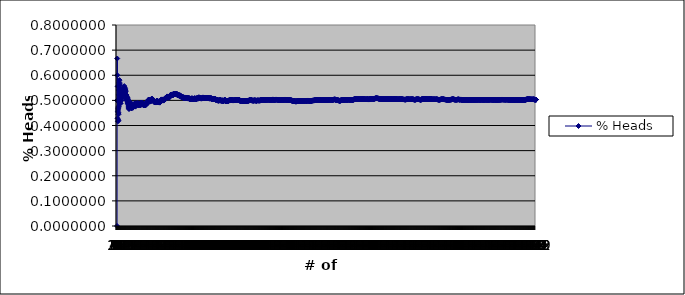
| Category | % Heads |
|---|---|
| 0 | 0 |
| 1 | 0.5 |
| 2 | 0.667 |
| 3 | 0.5 |
| 4 | 0.6 |
| 5 | 0.5 |
| 6 | 0.429 |
| 7 | 0.5 |
| 8 | 0.556 |
| 9 | 0.5 |
| 10 | 0.455 |
| 11 | 0.417 |
| 12 | 0.462 |
| 13 | 0.5 |
| 14 | 0.467 |
| 15 | 0.5 |
| 16 | 0.471 |
| 17 | 0.444 |
| 18 | 0.421 |
| 19 | 0.45 |
| 20 | 0.476 |
| 21 | 0.5 |
| 22 | 0.522 |
| 23 | 0.542 |
| 24 | 0.56 |
| 25 | 0.538 |
| 26 | 0.556 |
| 27 | 0.571 |
| 28 | 0.552 |
| 29 | 0.567 |
| 30 | 0.581 |
| 31 | 0.562 |
| 32 | 0.545 |
| 33 | 0.529 |
| 34 | 0.543 |
| 35 | 0.528 |
| 36 | 0.514 |
| 37 | 0.5 |
| 38 | 0.487 |
| 39 | 0.5 |
| 40 | 0.512 |
| 41 | 0.5 |
| 42 | 0.488 |
| 43 | 0.5 |
| 44 | 0.511 |
| 45 | 0.5 |
| 46 | 0.511 |
| 47 | 0.521 |
| 48 | 0.51 |
| 49 | 0.5 |
| 50 | 0.51 |
| 51 | 0.519 |
| 52 | 0.509 |
| 53 | 0.5 |
| 54 | 0.509 |
| 55 | 0.518 |
| 56 | 0.526 |
| 57 | 0.517 |
| 58 | 0.525 |
| 59 | 0.533 |
| 60 | 0.541 |
| 61 | 0.532 |
| 62 | 0.524 |
| 63 | 0.531 |
| 64 | 0.523 |
| 65 | 0.53 |
| 66 | 0.537 |
| 67 | 0.544 |
| 68 | 0.536 |
| 69 | 0.529 |
| 70 | 0.521 |
| 71 | 0.528 |
| 72 | 0.534 |
| 73 | 0.541 |
| 74 | 0.547 |
| 75 | 0.539 |
| 76 | 0.532 |
| 77 | 0.538 |
| 78 | 0.544 |
| 79 | 0.538 |
| 80 | 0.543 |
| 81 | 0.537 |
| 82 | 0.53 |
| 83 | 0.536 |
| 84 | 0.541 |
| 85 | 0.547 |
| 86 | 0.552 |
| 87 | 0.557 |
| 88 | 0.551 |
| 89 | 0.544 |
| 90 | 0.549 |
| 91 | 0.543 |
| 92 | 0.538 |
| 93 | 0.532 |
| 94 | 0.537 |
| 95 | 0.542 |
| 96 | 0.546 |
| 97 | 0.541 |
| 98 | 0.535 |
| 99 | 0.54 |
| 100 | 0.535 |
| 101 | 0.529 |
| 102 | 0.524 |
| 103 | 0.519 |
| 104 | 0.524 |
| 105 | 0.519 |
| 106 | 0.523 |
| 107 | 0.519 |
| 108 | 0.523 |
| 109 | 0.518 |
| 110 | 0.514 |
| 111 | 0.509 |
| 112 | 0.504 |
| 113 | 0.5 |
| 114 | 0.504 |
| 115 | 0.509 |
| 116 | 0.513 |
| 117 | 0.508 |
| 118 | 0.513 |
| 119 | 0.508 |
| 120 | 0.512 |
| 121 | 0.508 |
| 122 | 0.512 |
| 123 | 0.508 |
| 124 | 0.504 |
| 125 | 0.5 |
| 126 | 0.504 |
| 127 | 0.5 |
| 128 | 0.496 |
| 129 | 0.492 |
| 130 | 0.489 |
| 131 | 0.492 |
| 132 | 0.489 |
| 133 | 0.485 |
| 134 | 0.489 |
| 135 | 0.485 |
| 136 | 0.489 |
| 137 | 0.486 |
| 138 | 0.482 |
| 139 | 0.479 |
| 140 | 0.475 |
| 141 | 0.472 |
| 142 | 0.469 |
| 143 | 0.465 |
| 144 | 0.469 |
| 145 | 0.473 |
| 146 | 0.476 |
| 147 | 0.48 |
| 148 | 0.477 |
| 149 | 0.48 |
| 150 | 0.483 |
| 151 | 0.487 |
| 152 | 0.49 |
| 153 | 0.487 |
| 154 | 0.49 |
| 155 | 0.494 |
| 156 | 0.49 |
| 157 | 0.487 |
| 158 | 0.484 |
| 159 | 0.488 |
| 160 | 0.484 |
| 161 | 0.481 |
| 162 | 0.479 |
| 163 | 0.482 |
| 164 | 0.485 |
| 165 | 0.488 |
| 166 | 0.485 |
| 167 | 0.482 |
| 168 | 0.479 |
| 169 | 0.476 |
| 170 | 0.474 |
| 171 | 0.471 |
| 172 | 0.468 |
| 173 | 0.471 |
| 174 | 0.474 |
| 175 | 0.472 |
| 176 | 0.469 |
| 177 | 0.472 |
| 178 | 0.475 |
| 179 | 0.478 |
| 180 | 0.481 |
| 181 | 0.478 |
| 182 | 0.475 |
| 183 | 0.473 |
| 184 | 0.476 |
| 185 | 0.473 |
| 186 | 0.476 |
| 187 | 0.473 |
| 188 | 0.471 |
| 189 | 0.474 |
| 190 | 0.471 |
| 191 | 0.474 |
| 192 | 0.477 |
| 193 | 0.479 |
| 194 | 0.477 |
| 195 | 0.48 |
| 196 | 0.477 |
| 197 | 0.48 |
| 198 | 0.477 |
| 199 | 0.48 |
| 200 | 0.478 |
| 201 | 0.48 |
| 202 | 0.483 |
| 203 | 0.48 |
| 204 | 0.483 |
| 205 | 0.481 |
| 206 | 0.478 |
| 207 | 0.481 |
| 208 | 0.483 |
| 209 | 0.481 |
| 210 | 0.483 |
| 211 | 0.486 |
| 212 | 0.488 |
| 213 | 0.486 |
| 214 | 0.488 |
| 215 | 0.486 |
| 216 | 0.484 |
| 217 | 0.482 |
| 218 | 0.479 |
| 219 | 0.477 |
| 220 | 0.475 |
| 221 | 0.477 |
| 222 | 0.48 |
| 223 | 0.482 |
| 224 | 0.484 |
| 225 | 0.482 |
| 226 | 0.485 |
| 227 | 0.482 |
| 228 | 0.48 |
| 229 | 0.483 |
| 230 | 0.481 |
| 231 | 0.483 |
| 232 | 0.485 |
| 233 | 0.487 |
| 234 | 0.485 |
| 235 | 0.483 |
| 236 | 0.481 |
| 237 | 0.483 |
| 238 | 0.485 |
| 239 | 0.488 |
| 240 | 0.49 |
| 241 | 0.488 |
| 242 | 0.486 |
| 243 | 0.488 |
| 244 | 0.486 |
| 245 | 0.488 |
| 246 | 0.486 |
| 247 | 0.484 |
| 248 | 0.482 |
| 249 | 0.484 |
| 250 | 0.486 |
| 251 | 0.488 |
| 252 | 0.486 |
| 253 | 0.488 |
| 254 | 0.486 |
| 255 | 0.484 |
| 256 | 0.482 |
| 257 | 0.481 |
| 258 | 0.483 |
| 259 | 0.481 |
| 260 | 0.483 |
| 261 | 0.485 |
| 262 | 0.487 |
| 263 | 0.485 |
| 264 | 0.483 |
| 265 | 0.485 |
| 266 | 0.483 |
| 267 | 0.481 |
| 268 | 0.483 |
| 269 | 0.485 |
| 270 | 0.483 |
| 271 | 0.485 |
| 272 | 0.484 |
| 273 | 0.485 |
| 274 | 0.484 |
| 275 | 0.486 |
| 276 | 0.484 |
| 277 | 0.482 |
| 278 | 0.48 |
| 279 | 0.482 |
| 280 | 0.484 |
| 281 | 0.486 |
| 282 | 0.488 |
| 283 | 0.489 |
| 284 | 0.491 |
| 285 | 0.49 |
| 286 | 0.488 |
| 287 | 0.49 |
| 288 | 0.488 |
| 289 | 0.486 |
| 290 | 0.485 |
| 291 | 0.483 |
| 292 | 0.485 |
| 293 | 0.483 |
| 294 | 0.485 |
| 295 | 0.486 |
| 296 | 0.485 |
| 297 | 0.483 |
| 298 | 0.485 |
| 299 | 0.487 |
| 300 | 0.488 |
| 301 | 0.49 |
| 302 | 0.488 |
| 303 | 0.487 |
| 304 | 0.489 |
| 305 | 0.487 |
| 306 | 0.489 |
| 307 | 0.487 |
| 308 | 0.485 |
| 309 | 0.487 |
| 310 | 0.486 |
| 311 | 0.487 |
| 312 | 0.486 |
| 313 | 0.484 |
| 314 | 0.483 |
| 315 | 0.484 |
| 316 | 0.483 |
| 317 | 0.481 |
| 318 | 0.483 |
| 319 | 0.481 |
| 320 | 0.48 |
| 321 | 0.481 |
| 322 | 0.483 |
| 323 | 0.481 |
| 324 | 0.483 |
| 325 | 0.482 |
| 326 | 0.48 |
| 327 | 0.482 |
| 328 | 0.483 |
| 329 | 0.482 |
| 330 | 0.48 |
| 331 | 0.482 |
| 332 | 0.483 |
| 333 | 0.482 |
| 334 | 0.481 |
| 335 | 0.482 |
| 336 | 0.481 |
| 337 | 0.482 |
| 338 | 0.481 |
| 339 | 0.482 |
| 340 | 0.484 |
| 341 | 0.482 |
| 342 | 0.484 |
| 343 | 0.485 |
| 344 | 0.484 |
| 345 | 0.483 |
| 346 | 0.484 |
| 347 | 0.483 |
| 348 | 0.484 |
| 349 | 0.486 |
| 350 | 0.484 |
| 351 | 0.486 |
| 352 | 0.487 |
| 353 | 0.489 |
| 354 | 0.49 |
| 355 | 0.492 |
| 356 | 0.49 |
| 357 | 0.492 |
| 358 | 0.493 |
| 359 | 0.494 |
| 360 | 0.493 |
| 361 | 0.494 |
| 362 | 0.493 |
| 363 | 0.492 |
| 364 | 0.493 |
| 365 | 0.495 |
| 366 | 0.493 |
| 367 | 0.495 |
| 368 | 0.496 |
| 369 | 0.497 |
| 370 | 0.499 |
| 371 | 0.5 |
| 372 | 0.501 |
| 373 | 0.5 |
| 374 | 0.501 |
| 375 | 0.5 |
| 376 | 0.499 |
| 377 | 0.5 |
| 378 | 0.499 |
| 379 | 0.5 |
| 380 | 0.501 |
| 381 | 0.503 |
| 382 | 0.501 |
| 383 | 0.5 |
| 384 | 0.501 |
| 385 | 0.5 |
| 386 | 0.501 |
| 387 | 0.5 |
| 388 | 0.501 |
| 389 | 0.5 |
| 390 | 0.499 |
| 391 | 0.497 |
| 392 | 0.496 |
| 393 | 0.495 |
| 394 | 0.496 |
| 395 | 0.497 |
| 396 | 0.496 |
| 397 | 0.497 |
| 398 | 0.499 |
| 399 | 0.498 |
| 400 | 0.496 |
| 401 | 0.498 |
| 402 | 0.496 |
| 403 | 0.498 |
| 404 | 0.499 |
| 405 | 0.5 |
| 406 | 0.499 |
| 407 | 0.5 |
| 408 | 0.501 |
| 409 | 0.5 |
| 410 | 0.501 |
| 411 | 0.502 |
| 412 | 0.504 |
| 413 | 0.505 |
| 414 | 0.506 |
| 415 | 0.507 |
| 416 | 0.506 |
| 417 | 0.505 |
| 418 | 0.504 |
| 419 | 0.505 |
| 420 | 0.504 |
| 421 | 0.505 |
| 422 | 0.504 |
| 423 | 0.502 |
| 424 | 0.501 |
| 425 | 0.502 |
| 426 | 0.501 |
| 427 | 0.502 |
| 428 | 0.501 |
| 429 | 0.5 |
| 430 | 0.501 |
| 431 | 0.502 |
| 432 | 0.501 |
| 433 | 0.5 |
| 434 | 0.499 |
| 435 | 0.5 |
| 436 | 0.499 |
| 437 | 0.498 |
| 438 | 0.497 |
| 439 | 0.495 |
| 440 | 0.497 |
| 441 | 0.495 |
| 442 | 0.497 |
| 443 | 0.495 |
| 444 | 0.494 |
| 445 | 0.493 |
| 446 | 0.492 |
| 447 | 0.493 |
| 448 | 0.494 |
| 449 | 0.493 |
| 450 | 0.494 |
| 451 | 0.496 |
| 452 | 0.494 |
| 453 | 0.493 |
| 454 | 0.495 |
| 455 | 0.496 |
| 456 | 0.495 |
| 457 | 0.493 |
| 458 | 0.492 |
| 459 | 0.493 |
| 460 | 0.495 |
| 461 | 0.494 |
| 462 | 0.492 |
| 463 | 0.491 |
| 464 | 0.492 |
| 465 | 0.494 |
| 466 | 0.495 |
| 467 | 0.494 |
| 468 | 0.495 |
| 469 | 0.496 |
| 470 | 0.495 |
| 471 | 0.494 |
| 472 | 0.495 |
| 473 | 0.496 |
| 474 | 0.497 |
| 475 | 0.498 |
| 476 | 0.499 |
| 477 | 0.498 |
| 478 | 0.497 |
| 479 | 0.496 |
| 480 | 0.497 |
| 481 | 0.498 |
| 482 | 0.497 |
| 483 | 0.498 |
| 484 | 0.497 |
| 485 | 0.496 |
| 486 | 0.495 |
| 487 | 0.494 |
| 488 | 0.493 |
| 489 | 0.492 |
| 490 | 0.493 |
| 491 | 0.494 |
| 492 | 0.495 |
| 493 | 0.496 |
| 494 | 0.495 |
| 495 | 0.494 |
| 496 | 0.493 |
| 497 | 0.492 |
| 498 | 0.493 |
| 499 | 0.492 |
| 500 | 0.493 |
| 501 | 0.492 |
| 502 | 0.493 |
| 503 | 0.494 |
| 504 | 0.495 |
| 505 | 0.494 |
| 506 | 0.493 |
| 507 | 0.492 |
| 508 | 0.491 |
| 509 | 0.492 |
| 510 | 0.491 |
| 511 | 0.492 |
| 512 | 0.493 |
| 513 | 0.494 |
| 514 | 0.495 |
| 515 | 0.494 |
| 516 | 0.495 |
| 517 | 0.496 |
| 518 | 0.497 |
| 519 | 0.498 |
| 520 | 0.497 |
| 521 | 0.498 |
| 522 | 0.497 |
| 523 | 0.498 |
| 524 | 0.499 |
| 525 | 0.5 |
| 526 | 0.501 |
| 527 | 0.502 |
| 528 | 0.501 |
| 529 | 0.502 |
| 530 | 0.503 |
| 531 | 0.504 |
| 532 | 0.503 |
| 533 | 0.502 |
| 534 | 0.501 |
| 535 | 0.502 |
| 536 | 0.503 |
| 537 | 0.504 |
| 538 | 0.503 |
| 539 | 0.502 |
| 540 | 0.501 |
| 541 | 0.502 |
| 542 | 0.501 |
| 543 | 0.5 |
| 544 | 0.499 |
| 545 | 0.5 |
| 546 | 0.501 |
| 547 | 0.502 |
| 548 | 0.503 |
| 549 | 0.504 |
| 550 | 0.503 |
| 551 | 0.502 |
| 552 | 0.501 |
| 553 | 0.5 |
| 554 | 0.499 |
| 555 | 0.5 |
| 556 | 0.501 |
| 557 | 0.502 |
| 558 | 0.501 |
| 559 | 0.502 |
| 560 | 0.503 |
| 561 | 0.504 |
| 562 | 0.504 |
| 563 | 0.504 |
| 564 | 0.503 |
| 565 | 0.504 |
| 566 | 0.504 |
| 567 | 0.505 |
| 568 | 0.504 |
| 569 | 0.504 |
| 570 | 0.504 |
| 571 | 0.505 |
| 572 | 0.506 |
| 573 | 0.505 |
| 574 | 0.506 |
| 575 | 0.507 |
| 576 | 0.508 |
| 577 | 0.509 |
| 578 | 0.509 |
| 579 | 0.509 |
| 580 | 0.508 |
| 581 | 0.509 |
| 582 | 0.508 |
| 583 | 0.507 |
| 584 | 0.508 |
| 585 | 0.509 |
| 586 | 0.509 |
| 587 | 0.51 |
| 588 | 0.509 |
| 589 | 0.51 |
| 590 | 0.511 |
| 591 | 0.51 |
| 592 | 0.511 |
| 593 | 0.512 |
| 594 | 0.513 |
| 595 | 0.513 |
| 596 | 0.513 |
| 597 | 0.513 |
| 598 | 0.514 |
| 599 | 0.515 |
| 600 | 0.516 |
| 601 | 0.515 |
| 602 | 0.514 |
| 603 | 0.513 |
| 604 | 0.512 |
| 605 | 0.513 |
| 606 | 0.512 |
| 607 | 0.513 |
| 608 | 0.514 |
| 609 | 0.515 |
| 610 | 0.514 |
| 611 | 0.513 |
| 612 | 0.512 |
| 613 | 0.511 |
| 614 | 0.512 |
| 615 | 0.513 |
| 616 | 0.512 |
| 617 | 0.511 |
| 618 | 0.511 |
| 619 | 0.511 |
| 620 | 0.51 |
| 621 | 0.511 |
| 622 | 0.512 |
| 623 | 0.513 |
| 624 | 0.512 |
| 625 | 0.513 |
| 626 | 0.514 |
| 627 | 0.514 |
| 628 | 0.515 |
| 629 | 0.516 |
| 630 | 0.517 |
| 631 | 0.517 |
| 632 | 0.518 |
| 633 | 0.519 |
| 634 | 0.518 |
| 635 | 0.519 |
| 636 | 0.52 |
| 637 | 0.52 |
| 638 | 0.521 |
| 639 | 0.522 |
| 640 | 0.521 |
| 641 | 0.522 |
| 642 | 0.521 |
| 643 | 0.52 |
| 644 | 0.521 |
| 645 | 0.522 |
| 646 | 0.521 |
| 647 | 0.522 |
| 648 | 0.522 |
| 649 | 0.523 |
| 650 | 0.522 |
| 651 | 0.521 |
| 652 | 0.522 |
| 653 | 0.523 |
| 654 | 0.522 |
| 655 | 0.521 |
| 656 | 0.521 |
| 657 | 0.521 |
| 658 | 0.522 |
| 659 | 0.523 |
| 660 | 0.523 |
| 661 | 0.524 |
| 662 | 0.523 |
| 663 | 0.523 |
| 664 | 0.522 |
| 665 | 0.523 |
| 666 | 0.522 |
| 667 | 0.521 |
| 668 | 0.522 |
| 669 | 0.522 |
| 670 | 0.523 |
| 671 | 0.522 |
| 672 | 0.523 |
| 673 | 0.524 |
| 674 | 0.524 |
| 675 | 0.525 |
| 676 | 0.524 |
| 677 | 0.525 |
| 678 | 0.524 |
| 679 | 0.524 |
| 680 | 0.524 |
| 681 | 0.525 |
| 682 | 0.524 |
| 683 | 0.523 |
| 684 | 0.524 |
| 685 | 0.525 |
| 686 | 0.524 |
| 687 | 0.525 |
| 688 | 0.524 |
| 689 | 0.525 |
| 690 | 0.524 |
| 691 | 0.525 |
| 692 | 0.525 |
| 693 | 0.524 |
| 694 | 0.525 |
| 695 | 0.524 |
| 696 | 0.524 |
| 697 | 0.524 |
| 698 | 0.525 |
| 699 | 0.526 |
| 700 | 0.525 |
| 701 | 0.524 |
| 702 | 0.523 |
| 703 | 0.524 |
| 704 | 0.525 |
| 705 | 0.524 |
| 706 | 0.525 |
| 707 | 0.525 |
| 708 | 0.525 |
| 709 | 0.525 |
| 710 | 0.525 |
| 711 | 0.524 |
| 712 | 0.525 |
| 713 | 0.524 |
| 714 | 0.524 |
| 715 | 0.525 |
| 716 | 0.524 |
| 717 | 0.524 |
| 718 | 0.523 |
| 719 | 0.522 |
| 720 | 0.521 |
| 721 | 0.521 |
| 722 | 0.521 |
| 723 | 0.521 |
| 724 | 0.521 |
| 725 | 0.522 |
| 726 | 0.521 |
| 727 | 0.521 |
| 728 | 0.521 |
| 729 | 0.521 |
| 730 | 0.521 |
| 731 | 0.52 |
| 732 | 0.521 |
| 733 | 0.52 |
| 734 | 0.521 |
| 735 | 0.522 |
| 736 | 0.521 |
| 737 | 0.522 |
| 738 | 0.521 |
| 739 | 0.52 |
| 740 | 0.52 |
| 741 | 0.52 |
| 742 | 0.52 |
| 743 | 0.519 |
| 744 | 0.518 |
| 745 | 0.519 |
| 746 | 0.518 |
| 747 | 0.517 |
| 748 | 0.518 |
| 749 | 0.519 |
| 750 | 0.519 |
| 751 | 0.52 |
| 752 | 0.519 |
| 753 | 0.52 |
| 754 | 0.519 |
| 755 | 0.519 |
| 756 | 0.518 |
| 757 | 0.517 |
| 758 | 0.518 |
| 759 | 0.517 |
| 760 | 0.516 |
| 761 | 0.517 |
| 762 | 0.516 |
| 763 | 0.516 |
| 764 | 0.515 |
| 765 | 0.514 |
| 766 | 0.515 |
| 767 | 0.514 |
| 768 | 0.515 |
| 769 | 0.514 |
| 770 | 0.514 |
| 771 | 0.514 |
| 772 | 0.515 |
| 773 | 0.514 |
| 774 | 0.514 |
| 775 | 0.513 |
| 776 | 0.514 |
| 777 | 0.514 |
| 778 | 0.515 |
| 779 | 0.514 |
| 780 | 0.513 |
| 781 | 0.513 |
| 782 | 0.512 |
| 783 | 0.511 |
| 784 | 0.511 |
| 785 | 0.511 |
| 786 | 0.512 |
| 787 | 0.513 |
| 788 | 0.512 |
| 789 | 0.513 |
| 790 | 0.512 |
| 791 | 0.511 |
| 792 | 0.511 |
| 793 | 0.51 |
| 794 | 0.509 |
| 795 | 0.51 |
| 796 | 0.509 |
| 797 | 0.51 |
| 798 | 0.509 |
| 799 | 0.51 |
| 800 | 0.511 |
| 801 | 0.51 |
| 802 | 0.511 |
| 803 | 0.51 |
| 804 | 0.511 |
| 805 | 0.511 |
| 806 | 0.512 |
| 807 | 0.511 |
| 808 | 0.511 |
| 809 | 0.511 |
| 810 | 0.51 |
| 811 | 0.51 |
| 812 | 0.509 |
| 813 | 0.51 |
| 814 | 0.509 |
| 815 | 0.51 |
| 816 | 0.509 |
| 817 | 0.51 |
| 818 | 0.509 |
| 819 | 0.51 |
| 820 | 0.509 |
| 821 | 0.51 |
| 822 | 0.509 |
| 823 | 0.51 |
| 824 | 0.51 |
| 825 | 0.511 |
| 826 | 0.51 |
| 827 | 0.51 |
| 828 | 0.509 |
| 829 | 0.508 |
| 830 | 0.508 |
| 831 | 0.508 |
| 832 | 0.508 |
| 833 | 0.508 |
| 834 | 0.509 |
| 835 | 0.508 |
| 836 | 0.508 |
| 837 | 0.508 |
| 838 | 0.508 |
| 839 | 0.508 |
| 840 | 0.508 |
| 841 | 0.508 |
| 842 | 0.509 |
| 843 | 0.508 |
| 844 | 0.509 |
| 845 | 0.508 |
| 846 | 0.508 |
| 847 | 0.507 |
| 848 | 0.508 |
| 849 | 0.508 |
| 850 | 0.508 |
| 851 | 0.508 |
| 852 | 0.509 |
| 853 | 0.508 |
| 854 | 0.508 |
| 855 | 0.508 |
| 856 | 0.508 |
| 857 | 0.507 |
| 858 | 0.508 |
| 859 | 0.508 |
| 860 | 0.509 |
| 861 | 0.508 |
| 862 | 0.508 |
| 863 | 0.507 |
| 864 | 0.508 |
| 865 | 0.508 |
| 866 | 0.507 |
| 867 | 0.507 |
| 868 | 0.506 |
| 869 | 0.506 |
| 870 | 0.506 |
| 871 | 0.506 |
| 872 | 0.505 |
| 873 | 0.506 |
| 874 | 0.505 |
| 875 | 0.506 |
| 876 | 0.506 |
| 877 | 0.506 |
| 878 | 0.506 |
| 879 | 0.507 |
| 880 | 0.506 |
| 881 | 0.507 |
| 882 | 0.506 |
| 883 | 0.507 |
| 884 | 0.506 |
| 885 | 0.506 |
| 886 | 0.506 |
| 887 | 0.506 |
| 888 | 0.506 |
| 889 | 0.507 |
| 890 | 0.507 |
| 891 | 0.508 |
| 892 | 0.507 |
| 893 | 0.508 |
| 894 | 0.508 |
| 895 | 0.508 |
| 896 | 0.507 |
| 897 | 0.508 |
| 898 | 0.507 |
| 899 | 0.507 |
| 900 | 0.507 |
| 901 | 0.507 |
| 902 | 0.506 |
| 903 | 0.506 |
| 904 | 0.506 |
| 905 | 0.507 |
| 906 | 0.506 |
| 907 | 0.506 |
| 908 | 0.505 |
| 909 | 0.504 |
| 910 | 0.504 |
| 911 | 0.504 |
| 912 | 0.504 |
| 913 | 0.504 |
| 914 | 0.505 |
| 915 | 0.505 |
| 916 | 0.506 |
| 917 | 0.505 |
| 918 | 0.506 |
| 919 | 0.507 |
| 920 | 0.507 |
| 921 | 0.507 |
| 922 | 0.506 |
| 923 | 0.506 |
| 924 | 0.507 |
| 925 | 0.508 |
| 926 | 0.508 |
| 927 | 0.509 |
| 928 | 0.508 |
| 929 | 0.508 |
| 930 | 0.507 |
| 931 | 0.508 |
| 932 | 0.507 |
| 933 | 0.506 |
| 934 | 0.507 |
| 935 | 0.506 |
| 936 | 0.507 |
| 937 | 0.506 |
| 938 | 0.506 |
| 939 | 0.505 |
| 940 | 0.506 |
| 941 | 0.505 |
| 942 | 0.506 |
| 943 | 0.505 |
| 944 | 0.505 |
| 945 | 0.505 |
| 946 | 0.506 |
| 947 | 0.506 |
| 948 | 0.507 |
| 949 | 0.507 |
| 950 | 0.508 |
| 951 | 0.507 |
| 952 | 0.508 |
| 953 | 0.508 |
| 954 | 0.509 |
| 955 | 0.508 |
| 956 | 0.508 |
| 957 | 0.508 |
| 958 | 0.508 |
| 959 | 0.507 |
| 960 | 0.508 |
| 961 | 0.507 |
| 962 | 0.507 |
| 963 | 0.507 |
| 964 | 0.507 |
| 965 | 0.507 |
| 966 | 0.508 |
| 967 | 0.508 |
| 968 | 0.509 |
| 969 | 0.508 |
| 970 | 0.509 |
| 971 | 0.509 |
| 972 | 0.51 |
| 973 | 0.51 |
| 974 | 0.511 |
| 975 | 0.511 |
| 976 | 0.512 |
| 977 | 0.512 |
| 978 | 0.512 |
| 979 | 0.511 |
| 980 | 0.511 |
| 981 | 0.51 |
| 982 | 0.511 |
| 983 | 0.51 |
| 984 | 0.51 |
| 985 | 0.509 |
| 986 | 0.51 |
| 987 | 0.51 |
| 988 | 0.51 |
| 989 | 0.509 |
| 990 | 0.509 |
| 991 | 0.509 |
| 992 | 0.509 |
| 993 | 0.509 |
| 994 | 0.51 |
| 995 | 0.51 |
| 996 | 0.51 |
| 997 | 0.51 |
| 998 | 0.51 |
| 999 | 0.509 |
| 1000 | 0.508 |
| 1001 | 0.509 |
| 1002 | 0.508 |
| 1003 | 0.508 |
| 1004 | 0.507 |
| 1005 | 0.507 |
| 1006 | 0.507 |
| 1007 | 0.507 |
| 1008 | 0.507 |
| 1009 | 0.508 |
| 1010 | 0.507 |
| 1011 | 0.508 |
| 1012 | 0.507 |
| 1013 | 0.508 |
| 1014 | 0.508 |
| 1015 | 0.509 |
| 1016 | 0.509 |
| 1017 | 0.509 |
| 1018 | 0.509 |
| 1019 | 0.51 |
| 1020 | 0.51 |
| 1021 | 0.51 |
| 1022 | 0.51 |
| 1023 | 0.511 |
| 1024 | 0.511 |
| 1025 | 0.512 |
| 1026 | 0.511 |
| 1027 | 0.512 |
| 1028 | 0.511 |
| 1029 | 0.511 |
| 1030 | 0.511 |
| 1031 | 0.511 |
| 1032 | 0.511 |
| 1033 | 0.511 |
| 1034 | 0.51 |
| 1035 | 0.511 |
| 1036 | 0.511 |
| 1037 | 0.511 |
| 1038 | 0.51 |
| 1039 | 0.51 |
| 1040 | 0.509 |
| 1041 | 0.509 |
| 1042 | 0.509 |
| 1043 | 0.51 |
| 1044 | 0.51 |
| 1045 | 0.511 |
| 1046 | 0.51 |
| 1047 | 0.51 |
| 1048 | 0.51 |
| 1049 | 0.51 |
| 1050 | 0.51 |
| 1051 | 0.51 |
| 1052 | 0.51 |
| 1053 | 0.509 |
| 1054 | 0.51 |
| 1055 | 0.509 |
| 1056 | 0.51 |
| 1057 | 0.51 |
| 1058 | 0.511 |
| 1059 | 0.51 |
| 1060 | 0.511 |
| 1061 | 0.51 |
| 1062 | 0.51 |
| 1063 | 0.51 |
| 1064 | 0.51 |
| 1065 | 0.509 |
| 1066 | 0.509 |
| 1067 | 0.509 |
| 1068 | 0.51 |
| 1069 | 0.51 |
| 1070 | 0.51 |
| 1071 | 0.51 |
| 1072 | 0.51 |
| 1073 | 0.509 |
| 1074 | 0.51 |
| 1075 | 0.509 |
| 1076 | 0.51 |
| 1077 | 0.509 |
| 1078 | 0.51 |
| 1079 | 0.51 |
| 1080 | 0.51 |
| 1081 | 0.509 |
| 1082 | 0.51 |
| 1083 | 0.51 |
| 1084 | 0.51 |
| 1085 | 0.509 |
| 1086 | 0.51 |
| 1087 | 0.51 |
| 1088 | 0.511 |
| 1089 | 0.51 |
| 1090 | 0.51 |
| 1091 | 0.51 |
| 1092 | 0.511 |
| 1093 | 0.51 |
| 1094 | 0.511 |
| 1095 | 0.51 |
| 1096 | 0.51 |
| 1097 | 0.509 |
| 1098 | 0.509 |
| 1099 | 0.509 |
| 1100 | 0.509 |
| 1101 | 0.508 |
| 1102 | 0.508 |
| 1103 | 0.507 |
| 1104 | 0.508 |
| 1105 | 0.507 |
| 1106 | 0.507 |
| 1107 | 0.507 |
| 1108 | 0.508 |
| 1109 | 0.507 |
| 1110 | 0.508 |
| 1111 | 0.508 |
| 1112 | 0.509 |
| 1113 | 0.508 |
| 1114 | 0.508 |
| 1115 | 0.508 |
| 1116 | 0.509 |
| 1117 | 0.508 |
| 1118 | 0.508 |
| 1119 | 0.508 |
| 1120 | 0.508 |
| 1121 | 0.509 |
| 1122 | 0.508 |
| 1123 | 0.508 |
| 1124 | 0.508 |
| 1125 | 0.507 |
| 1126 | 0.507 |
| 1127 | 0.507 |
| 1128 | 0.508 |
| 1129 | 0.507 |
| 1130 | 0.507 |
| 1131 | 0.506 |
| 1132 | 0.506 |
| 1133 | 0.505 |
| 1134 | 0.505 |
| 1135 | 0.505 |
| 1136 | 0.506 |
| 1137 | 0.506 |
| 1138 | 0.506 |
| 1139 | 0.505 |
| 1140 | 0.505 |
| 1141 | 0.505 |
| 1142 | 0.506 |
| 1143 | 0.506 |
| 1144 | 0.506 |
| 1145 | 0.506 |
| 1146 | 0.506 |
| 1147 | 0.505 |
| 1148 | 0.506 |
| 1149 | 0.506 |
| 1150 | 0.506 |
| 1151 | 0.505 |
| 1152 | 0.505 |
| 1153 | 0.504 |
| 1154 | 0.505 |
| 1155 | 0.505 |
| 1156 | 0.506 |
| 1157 | 0.506 |
| 1158 | 0.506 |
| 1159 | 0.505 |
| 1160 | 0.505 |
| 1161 | 0.505 |
| 1162 | 0.505 |
| 1163 | 0.505 |
| 1164 | 0.505 |
| 1165 | 0.505 |
| 1166 | 0.505 |
| 1167 | 0.505 |
| 1168 | 0.506 |
| 1169 | 0.505 |
| 1170 | 0.505 |
| 1171 | 0.505 |
| 1172 | 0.505 |
| 1173 | 0.505 |
| 1174 | 0.505 |
| 1175 | 0.504 |
| 1176 | 0.504 |
| 1177 | 0.503 |
| 1178 | 0.503 |
| 1179 | 0.503 |
| 1180 | 0.502 |
| 1181 | 0.503 |
| 1182 | 0.502 |
| 1183 | 0.503 |
| 1184 | 0.503 |
| 1185 | 0.503 |
| 1186 | 0.502 |
| 1187 | 0.503 |
| 1188 | 0.503 |
| 1189 | 0.503 |
| 1190 | 0.503 |
| 1191 | 0.503 |
| 1192 | 0.503 |
| 1193 | 0.503 |
| 1194 | 0.502 |
| 1195 | 0.502 |
| 1196 | 0.501 |
| 1197 | 0.502 |
| 1198 | 0.501 |
| 1199 | 0.502 |
| 1200 | 0.501 |
| 1201 | 0.501 |
| 1202 | 0.501 |
| 1203 | 0.501 |
| 1204 | 0.5 |
| 1205 | 0.5 |
| 1206 | 0.5 |
| 1207 | 0.499 |
| 1208 | 0.499 |
| 1209 | 0.498 |
| 1210 | 0.499 |
| 1211 | 0.499 |
| 1212 | 0.5 |
| 1213 | 0.499 |
| 1214 | 0.5 |
| 1215 | 0.5 |
| 1216 | 0.5 |
| 1217 | 0.5 |
| 1218 | 0.5 |
| 1219 | 0.499 |
| 1220 | 0.5 |
| 1221 | 0.499 |
| 1222 | 0.5 |
| 1223 | 0.5 |
| 1224 | 0.5 |
| 1225 | 0.5 |
| 1226 | 0.5 |
| 1227 | 0.501 |
| 1228 | 0.5 |
| 1229 | 0.501 |
| 1230 | 0.501 |
| 1231 | 0.501 |
| 1232 | 0.501 |
| 1233 | 0.501 |
| 1234 | 0.5 |
| 1235 | 0.5 |
| 1236 | 0.5 |
| 1237 | 0.5 |
| 1238 | 0.5 |
| 1239 | 0.5 |
| 1240 | 0.5 |
| 1241 | 0.499 |
| 1242 | 0.499 |
| 1243 | 0.499 |
| 1244 | 0.499 |
| 1245 | 0.498 |
| 1246 | 0.499 |
| 1247 | 0.498 |
| 1248 | 0.499 |
| 1249 | 0.499 |
| 1250 | 0.5 |
| 1251 | 0.499 |
| 1252 | 0.5 |
| 1253 | 0.5 |
| 1254 | 0.5 |
| 1255 | 0.5 |
| 1256 | 0.5 |
| 1257 | 0.499 |
| 1258 | 0.499 |
| 1259 | 0.498 |
| 1260 | 0.498 |
| 1261 | 0.498 |
| 1262 | 0.498 |
| 1263 | 0.498 |
| 1264 | 0.498 |
| 1265 | 0.498 |
| 1266 | 0.498 |
| 1267 | 0.498 |
| 1268 | 0.497 |
| 1269 | 0.498 |
| 1270 | 0.497 |
| 1271 | 0.498 |
| 1272 | 0.498 |
| 1273 | 0.498 |
| 1274 | 0.499 |
| 1275 | 0.499 |
| 1276 | 0.499 |
| 1277 | 0.499 |
| 1278 | 0.5 |
| 1279 | 0.5 |
| 1280 | 0.5 |
| 1281 | 0.501 |
| 1282 | 0.5 |
| 1283 | 0.501 |
| 1284 | 0.501 |
| 1285 | 0.502 |
| 1286 | 0.502 |
| 1287 | 0.502 |
| 1288 | 0.501 |
| 1289 | 0.501 |
| 1290 | 0.5 |
| 1291 | 0.5 |
| 1292 | 0.5 |
| 1293 | 0.499 |
| 1294 | 0.499 |
| 1295 | 0.498 |
| 1296 | 0.498 |
| 1297 | 0.498 |
| 1298 | 0.497 |
| 1299 | 0.497 |
| 1300 | 0.497 |
| 1301 | 0.497 |
| 1302 | 0.497 |
| 1303 | 0.497 |
| 1304 | 0.497 |
| 1305 | 0.498 |
| 1306 | 0.497 |
| 1307 | 0.498 |
| 1308 | 0.497 |
| 1309 | 0.498 |
| 1310 | 0.498 |
| 1311 | 0.498 |
| 1312 | 0.498 |
| 1313 | 0.498 |
| 1314 | 0.499 |
| 1315 | 0.498 |
| 1316 | 0.498 |
| 1317 | 0.498 |
| 1318 | 0.498 |
| 1319 | 0.498 |
| 1320 | 0.499 |
| 1321 | 0.498 |
| 1322 | 0.498 |
| 1323 | 0.498 |
| 1324 | 0.499 |
| 1325 | 0.498 |
| 1326 | 0.498 |
| 1327 | 0.498 |
| 1328 | 0.498 |
| 1329 | 0.498 |
| 1330 | 0.499 |
| 1331 | 0.499 |
| 1332 | 0.5 |
| 1333 | 0.5 |
| 1334 | 0.5 |
| 1335 | 0.5 |
| 1336 | 0.5 |
| 1337 | 0.5 |
| 1338 | 0.5 |
| 1339 | 0.499 |
| 1340 | 0.5 |
| 1341 | 0.499 |
| 1342 | 0.5 |
| 1343 | 0.5 |
| 1344 | 0.5 |
| 1345 | 0.5 |
| 1346 | 0.5 |
| 1347 | 0.501 |
| 1348 | 0.501 |
| 1349 | 0.501 |
| 1350 | 0.501 |
| 1351 | 0.501 |
| 1352 | 0.502 |
| 1353 | 0.501 |
| 1354 | 0.502 |
| 1355 | 0.502 |
| 1356 | 0.503 |
| 1357 | 0.503 |
| 1358 | 0.503 |
| 1359 | 0.502 |
| 1360 | 0.503 |
| 1361 | 0.502 |
| 1362 | 0.503 |
| 1363 | 0.502 |
| 1364 | 0.502 |
| 1365 | 0.501 |
| 1366 | 0.501 |
| 1367 | 0.501 |
| 1368 | 0.502 |
| 1369 | 0.501 |
| 1370 | 0.502 |
| 1371 | 0.502 |
| 1372 | 0.502 |
| 1373 | 0.501 |
| 1374 | 0.501 |
| 1375 | 0.501 |
| 1376 | 0.5 |
| 1377 | 0.5 |
| 1378 | 0.5 |
| 1379 | 0.5 |
| 1380 | 0.5 |
| 1381 | 0.5 |
| 1382 | 0.5 |
| 1383 | 0.5 |
| 1384 | 0.5 |
| 1385 | 0.499 |
| 1386 | 0.5 |
| 1387 | 0.499 |
| 1388 | 0.5 |
| 1389 | 0.5 |
| 1390 | 0.5 |
| 1391 | 0.5 |
| 1392 | 0.5 |
| 1393 | 0.5 |
| 1394 | 0.5 |
| 1395 | 0.501 |
| 1396 | 0.501 |
| 1397 | 0.501 |
| 1398 | 0.5 |
| 1399 | 0.501 |
| 1400 | 0.5 |
| 1401 | 0.5 |
| 1402 | 0.5 |
| 1403 | 0.501 |
| 1404 | 0.5 |
| 1405 | 0.5 |
| 1406 | 0.5 |
| 1407 | 0.501 |
| 1408 | 0.5 |
| 1409 | 0.501 |
| 1410 | 0.501 |
| 1411 | 0.501 |
| 1412 | 0.501 |
| 1413 | 0.501 |
| 1414 | 0.502 |
| 1415 | 0.501 |
| 1416 | 0.501 |
| 1417 | 0.501 |
| 1418 | 0.502 |
| 1419 | 0.501 |
| 1420 | 0.502 |
| 1421 | 0.502 |
| 1422 | 0.502 |
| 1423 | 0.502 |
| 1424 | 0.502 |
| 1425 | 0.502 |
| 1426 | 0.502 |
| 1427 | 0.502 |
| 1428 | 0.502 |
| 1429 | 0.503 |
| 1430 | 0.503 |
| 1431 | 0.503 |
| 1432 | 0.502 |
| 1433 | 0.502 |
| 1434 | 0.502 |
| 1435 | 0.502 |
| 1436 | 0.502 |
| 1437 | 0.502 |
| 1438 | 0.502 |
| 1439 | 0.502 |
| 1440 | 0.502 |
| 1441 | 0.502 |
| 1442 | 0.502 |
| 1443 | 0.502 |
| 1444 | 0.502 |
| 1445 | 0.501 |
| 1446 | 0.501 |
| 1447 | 0.501 |
| 1448 | 0.502 |
| 1449 | 0.502 |
| 1450 | 0.502 |
| 1451 | 0.501 |
| 1452 | 0.501 |
| 1453 | 0.501 |
| 1454 | 0.501 |
| 1455 | 0.501 |
| 1456 | 0.501 |
| 1457 | 0.501 |
| 1458 | 0.501 |
| 1459 | 0.501 |
| 1460 | 0.501 |
| 1461 | 0.501 |
| 1462 | 0.5 |
| 1463 | 0.5 |
| 1464 | 0.5 |
| 1465 | 0.499 |
| 1466 | 0.499 |
| 1467 | 0.499 |
| 1468 | 0.498 |
| 1469 | 0.499 |
| 1470 | 0.498 |
| 1471 | 0.499 |
| 1472 | 0.498 |
| 1473 | 0.498 |
| 1474 | 0.498 |
| 1475 | 0.498 |
| 1476 | 0.498 |
| 1477 | 0.498 |
| 1478 | 0.498 |
| 1479 | 0.498 |
| 1480 | 0.498 |
| 1481 | 0.499 |
| 1482 | 0.499 |
| 1483 | 0.499 |
| 1484 | 0.499 |
| 1485 | 0.499 |
| 1486 | 0.499 |
| 1487 | 0.499 |
| 1488 | 0.498 |
| 1489 | 0.499 |
| 1490 | 0.498 |
| 1491 | 0.498 |
| 1492 | 0.498 |
| 1493 | 0.498 |
| 1494 | 0.498 |
| 1495 | 0.498 |
| 1496 | 0.498 |
| 1497 | 0.497 |
| 1498 | 0.498 |
| 1499 | 0.497 |
| 1500 | 0.498 |
| 1501 | 0.498 |
| 1502 | 0.498 |
| 1503 | 0.499 |
| 1504 | 0.498 |
| 1505 | 0.499 |
| 1506 | 0.498 |
| 1507 | 0.498 |
| 1508 | 0.498 |
| 1509 | 0.497 |
| 1510 | 0.498 |
| 1511 | 0.498 |
| 1512 | 0.498 |
| 1513 | 0.498 |
| 1514 | 0.498 |
| 1515 | 0.498 |
| 1516 | 0.498 |
| 1517 | 0.497 |
| 1518 | 0.498 |
| 1519 | 0.498 |
| 1520 | 0.498 |
| 1521 | 0.498 |
| 1522 | 0.498 |
| 1523 | 0.498 |
| 1524 | 0.498 |
| 1525 | 0.498 |
| 1526 | 0.498 |
| 1527 | 0.498 |
| 1528 | 0.498 |
| 1529 | 0.499 |
| 1530 | 0.498 |
| 1531 | 0.499 |
| 1532 | 0.498 |
| 1533 | 0.498 |
| 1534 | 0.498 |
| 1535 | 0.498 |
| 1536 | 0.498 |
| 1537 | 0.498 |
| 1538 | 0.498 |
| 1539 | 0.499 |
| 1540 | 0.498 |
| 1541 | 0.498 |
| 1542 | 0.498 |
| 1543 | 0.498 |
| 1544 | 0.498 |
| 1545 | 0.497 |
| 1546 | 0.498 |
| 1547 | 0.498 |
| 1548 | 0.498 |
| 1549 | 0.499 |
| 1550 | 0.499 |
| 1551 | 0.499 |
| 1552 | 0.498 |
| 1553 | 0.498 |
| 1554 | 0.498 |
| 1555 | 0.499 |
| 1556 | 0.499 |
| 1557 | 0.499 |
| 1558 | 0.498 |
| 1559 | 0.498 |
| 1560 | 0.498 |
| 1561 | 0.498 |
| 1562 | 0.498 |
| 1563 | 0.499 |
| 1564 | 0.499 |
| 1565 | 0.499 |
| 1566 | 0.498 |
| 1567 | 0.499 |
| 1568 | 0.499 |
| 1569 | 0.499 |
| 1570 | 0.5 |
| 1571 | 0.5 |
| 1572 | 0.5 |
| 1573 | 0.499 |
| 1574 | 0.499 |
| 1575 | 0.499 |
| 1576 | 0.5 |
| 1577 | 0.499 |
| 1578 | 0.5 |
| 1579 | 0.5 |
| 1580 | 0.5 |
| 1581 | 0.5 |
| 1582 | 0.5 |
| 1583 | 0.501 |
| 1584 | 0.501 |
| 1585 | 0.501 |
| 1586 | 0.501 |
| 1587 | 0.501 |
| 1588 | 0.5 |
| 1589 | 0.5 |
| 1590 | 0.5 |
| 1591 | 0.501 |
| 1592 | 0.501 |
| 1593 | 0.501 |
| 1594 | 0.501 |
| 1595 | 0.501 |
| 1596 | 0.5 |
| 1597 | 0.501 |
| 1598 | 0.501 |
| 1599 | 0.501 |
| 1600 | 0.5 |
| 1601 | 0.501 |
| 1602 | 0.501 |
| 1603 | 0.501 |
| 1604 | 0.5 |
| 1605 | 0.501 |
| 1606 | 0.5 |
| 1607 | 0.5 |
| 1608 | 0.5 |
| 1609 | 0.5 |
| 1610 | 0.5 |
| 1611 | 0.499 |
| 1612 | 0.5 |
| 1613 | 0.499 |
| 1614 | 0.499 |
| 1615 | 0.499 |
| 1616 | 0.499 |
| 1617 | 0.499 |
| 1618 | 0.499 |
| 1619 | 0.499 |
| 1620 | 0.499 |
| 1621 | 0.499 |
| 1622 | 0.5 |
| 1623 | 0.5 |
| 1624 | 0.5 |
| 1625 | 0.5 |
| 1626 | 0.5 |
| 1627 | 0.499 |
| 1628 | 0.499 |
| 1629 | 0.499 |
| 1630 | 0.499 |
| 1631 | 0.499 |
| 1632 | 0.498 |
| 1633 | 0.499 |
| 1634 | 0.499 |
| 1635 | 0.499 |
| 1636 | 0.5 |
| 1637 | 0.499 |
| 1638 | 0.5 |
| 1639 | 0.5 |
| 1640 | 0.5 |
| 1641 | 0.5 |
| 1642 | 0.5 |
| 1643 | 0.5 |
| 1644 | 0.5 |
| 1645 | 0.5 |
| 1646 | 0.5 |
| 1647 | 0.5 |
| 1648 | 0.5 |
| 1649 | 0.499 |
| 1650 | 0.5 |
| 1651 | 0.5 |
| 1652 | 0.5 |
| 1653 | 0.499 |
| 1654 | 0.5 |
| 1655 | 0.499 |
| 1656 | 0.499 |
| 1657 | 0.499 |
| 1658 | 0.499 |
| 1659 | 0.499 |
| 1660 | 0.498 |
| 1661 | 0.498 |
| 1662 | 0.498 |
| 1663 | 0.499 |
| 1664 | 0.499 |
| 1665 | 0.499 |
| 1666 | 0.499 |
| 1667 | 0.499 |
| 1668 | 0.499 |
| 1669 | 0.499 |
| 1670 | 0.499 |
| 1671 | 0.499 |
| 1672 | 0.5 |
| 1673 | 0.5 |
| 1674 | 0.5 |
| 1675 | 0.499 |
| 1676 | 0.5 |
| 1677 | 0.5 |
| 1678 | 0.5 |
| 1679 | 0.5 |
| 1680 | 0.5 |
| 1681 | 0.499 |
| 1682 | 0.5 |
| 1683 | 0.5 |
| 1684 | 0.5 |
| 1685 | 0.5 |
| 1686 | 0.5 |
| 1687 | 0.499 |
| 1688 | 0.499 |
| 1689 | 0.499 |
| 1690 | 0.499 |
| 1691 | 0.499 |
| 1692 | 0.499 |
| 1693 | 0.499 |
| 1694 | 0.499 |
| 1695 | 0.499 |
| 1696 | 0.5 |
| 1697 | 0.5 |
| 1698 | 0.5 |
| 1699 | 0.5 |
| 1700 | 0.5 |
| 1701 | 0.499 |
| 1702 | 0.499 |
| 1703 | 0.499 |
| 1704 | 0.499 |
| 1705 | 0.499 |
| 1706 | 0.5 |
| 1707 | 0.499 |
| 1708 | 0.5 |
| 1709 | 0.5 |
| 1710 | 0.5 |
| 1711 | 0.5 |
| 1712 | 0.5 |
| 1713 | 0.501 |
| 1714 | 0.501 |
| 1715 | 0.501 |
| 1716 | 0.501 |
| 1717 | 0.501 |
| 1718 | 0.501 |
| 1719 | 0.502 |
| 1720 | 0.501 |
| 1721 | 0.502 |
| 1722 | 0.502 |
| 1723 | 0.502 |
| 1724 | 0.502 |
| 1725 | 0.502 |
| 1726 | 0.501 |
| 1727 | 0.501 |
| 1728 | 0.501 |
| 1729 | 0.501 |
| 1730 | 0.501 |
| 1731 | 0.501 |
| 1732 | 0.501 |
| 1733 | 0.502 |
| 1734 | 0.501 |
| 1735 | 0.502 |
| 1736 | 0.501 |
| 1737 | 0.502 |
| 1738 | 0.501 |
| 1739 | 0.501 |
| 1740 | 0.501 |
| 1741 | 0.501 |
| 1742 | 0.501 |
| 1743 | 0.502 |
| 1744 | 0.502 |
| 1745 | 0.502 |
| 1746 | 0.501 |
| 1747 | 0.502 |
| 1748 | 0.502 |
| 1749 | 0.502 |
| 1750 | 0.502 |
| 1751 | 0.502 |
| 1752 | 0.502 |
| 1753 | 0.502 |
| 1754 | 0.502 |
| 1755 | 0.502 |
| 1756 | 0.502 |
| 1757 | 0.502 |
| 1758 | 0.501 |
| 1759 | 0.502 |
| 1760 | 0.501 |
| 1761 | 0.501 |
| 1762 | 0.501 |
| 1763 | 0.501 |
| 1764 | 0.5 |
| 1765 | 0.501 |
| 1766 | 0.501 |
| 1767 | 0.501 |
| 1768 | 0.501 |
| 1769 | 0.502 |
| 1770 | 0.501 |
| 1771 | 0.502 |
| 1772 | 0.501 |
| 1773 | 0.502 |
| 1774 | 0.501 |
| 1775 | 0.501 |
| 1776 | 0.501 |
| 1777 | 0.502 |
| 1778 | 0.502 |
| 1779 | 0.502 |
| 1780 | 0.502 |
| 1781 | 0.502 |
| 1782 | 0.503 |
| 1783 | 0.503 |
| 1784 | 0.503 |
| 1785 | 0.503 |
| 1786 | 0.503 |
| 1787 | 0.502 |
| 1788 | 0.502 |
| 1789 | 0.502 |
| 1790 | 0.502 |
| 1791 | 0.502 |
| 1792 | 0.503 |
| 1793 | 0.503 |
| 1794 | 0.503 |
| 1795 | 0.503 |
| 1796 | 0.503 |
| 1797 | 0.503 |
| 1798 | 0.503 |
| 1799 | 0.503 |
| 1800 | 0.503 |
| 1801 | 0.503 |
| 1802 | 0.503 |
| 1803 | 0.503 |
| 1804 | 0.503 |
| 1805 | 0.503 |
| 1806 | 0.503 |
| 1807 | 0.503 |
| 1808 | 0.502 |
| 1809 | 0.503 |
| 1810 | 0.502 |
| 1811 | 0.503 |
| 1812 | 0.503 |
| 1813 | 0.503 |
| 1814 | 0.503 |
| 1815 | 0.503 |
| 1816 | 0.503 |
| 1817 | 0.503 |
| 1818 | 0.502 |
| 1819 | 0.502 |
| 1820 | 0.502 |
| 1821 | 0.502 |
| 1822 | 0.502 |
| 1823 | 0.502 |
| 1824 | 0.502 |
| 1825 | 0.502 |
| 1826 | 0.502 |
| 1827 | 0.502 |
| 1828 | 0.502 |
| 1829 | 0.502 |
| 1830 | 0.502 |
| 1831 | 0.502 |
| 1832 | 0.502 |
| 1833 | 0.502 |
| 1834 | 0.502 |
| 1835 | 0.503 |
| 1836 | 0.503 |
| 1837 | 0.503 |
| 1838 | 0.502 |
| 1839 | 0.503 |
| 1840 | 0.503 |
| 1841 | 0.503 |
| 1842 | 0.502 |
| 1843 | 0.502 |
| 1844 | 0.502 |
| 1845 | 0.502 |
| 1846 | 0.502 |
| 1847 | 0.502 |
| 1848 | 0.502 |
| 1849 | 0.502 |
| 1850 | 0.502 |
| 1851 | 0.502 |
| 1852 | 0.502 |
| 1853 | 0.502 |
| 1854 | 0.502 |
| 1855 | 0.503 |
| 1856 | 0.503 |
| 1857 | 0.503 |
| 1858 | 0.503 |
| 1859 | 0.504 |
| 1860 | 0.503 |
| 1861 | 0.503 |
| 1862 | 0.503 |
| 1863 | 0.503 |
| 1864 | 0.503 |
| 1865 | 0.503 |
| 1866 | 0.502 |
| 1867 | 0.502 |
| 1868 | 0.502 |
| 1869 | 0.502 |
| 1870 | 0.502 |
| 1871 | 0.503 |
| 1872 | 0.502 |
| 1873 | 0.503 |
| 1874 | 0.502 |
| 1875 | 0.502 |
| 1876 | 0.502 |
| 1877 | 0.502 |
| 1878 | 0.502 |
| 1879 | 0.502 |
| 1880 | 0.502 |
| 1881 | 0.502 |
| 1882 | 0.502 |
| 1883 | 0.502 |
| 1884 | 0.502 |
| 1885 | 0.502 |
| 1886 | 0.502 |
| 1887 | 0.503 |
| 1888 | 0.503 |
| 1889 | 0.503 |
| 1890 | 0.503 |
| 1891 | 0.503 |
| 1892 | 0.503 |
| 1893 | 0.503 |
| 1894 | 0.503 |
| 1895 | 0.503 |
| 1896 | 0.503 |
| 1897 | 0.504 |
| 1898 | 0.503 |
| 1899 | 0.503 |
| 1900 | 0.503 |
| 1901 | 0.503 |
| 1902 | 0.503 |
| 1903 | 0.503 |
| 1904 | 0.503 |
| 1905 | 0.503 |
| 1906 | 0.503 |
| 1907 | 0.503 |
| 1908 | 0.503 |
| 1909 | 0.503 |
| 1910 | 0.503 |
| 1911 | 0.503 |
| 1912 | 0.503 |
| 1913 | 0.503 |
| 1914 | 0.503 |
| 1915 | 0.503 |
| 1916 | 0.503 |
| 1917 | 0.503 |
| 1918 | 0.502 |
| 1919 | 0.503 |
| 1920 | 0.502 |
| 1921 | 0.502 |
| 1922 | 0.502 |
| 1923 | 0.502 |
| 1924 | 0.501 |
| 1925 | 0.501 |
| 1926 | 0.501 |
| 1927 | 0.501 |
| 1928 | 0.501 |
| 1929 | 0.501 |
| 1930 | 0.501 |
| 1931 | 0.501 |
| 1932 | 0.501 |
| 1933 | 0.501 |
| 1934 | 0.501 |
| 1935 | 0.501 |
| 1936 | 0.501 |
| 1937 | 0.501 |
| 1938 | 0.501 |
| 1939 | 0.501 |
| 1940 | 0.501 |
| 1941 | 0.501 |
| 1942 | 0.501 |
| 1943 | 0.501 |
| 1944 | 0.501 |
| 1945 | 0.501 |
| 1946 | 0.501 |
| 1947 | 0.501 |
| 1948 | 0.501 |
| 1949 | 0.501 |
| 1950 | 0.501 |
| 1951 | 0.501 |
| 1952 | 0.501 |
| 1953 | 0.501 |
| 1954 | 0.501 |
| 1955 | 0.501 |
| 1956 | 0.501 |
| 1957 | 0.502 |
| 1958 | 0.502 |
| 1959 | 0.502 |
| 1960 | 0.502 |
| 1961 | 0.502 |
| 1962 | 0.502 |
| 1963 | 0.502 |
| 1964 | 0.502 |
| 1965 | 0.502 |
| 1966 | 0.502 |
| 1967 | 0.502 |
| 1968 | 0.502 |
| 1969 | 0.502 |
| 1970 | 0.502 |
| 1971 | 0.502 |
| 1972 | 0.502 |
| 1973 | 0.502 |
| 1974 | 0.502 |
| 1975 | 0.502 |
| 1976 | 0.502 |
| 1977 | 0.503 |
| 1978 | 0.503 |
| 1979 | 0.503 |
| 1980 | 0.503 |
| 1981 | 0.503 |
| 1982 | 0.503 |
| 1983 | 0.503 |
| 1984 | 0.503 |
| 1985 | 0.503 |
| 1986 | 0.502 |
| 1987 | 0.502 |
| 1988 | 0.502 |
| 1989 | 0.502 |
| 1990 | 0.502 |
| 1991 | 0.502 |
| 1992 | 0.502 |
| 1993 | 0.502 |
| 1994 | 0.502 |
| 1995 | 0.502 |
| 1996 | 0.502 |
| 1997 | 0.503 |
| 1998 | 0.503 |
| 1999 | 0.503 |
| 2000 | 0.503 |
| 2001 | 0.503 |
| 2002 | 0.503 |
| 2003 | 0.503 |
| 2004 | 0.503 |
| 2005 | 0.503 |
| 2006 | 0.503 |
| 2007 | 0.502 |
| 2008 | 0.503 |
| 2009 | 0.502 |
| 2010 | 0.503 |
| 2011 | 0.502 |
| 2012 | 0.502 |
| 2013 | 0.502 |
| 2014 | 0.503 |
| 2015 | 0.503 |
| 2016 | 0.503 |
| 2017 | 0.502 |
| 2018 | 0.503 |
| 2019 | 0.502 |
| 2020 | 0.502 |
| 2021 | 0.502 |
| 2022 | 0.502 |
| 2023 | 0.501 |
| 2024 | 0.502 |
| 2025 | 0.502 |
| 2026 | 0.502 |
| 2027 | 0.501 |
| 2028 | 0.502 |
| 2029 | 0.501 |
| 2030 | 0.501 |
| 2031 | 0.501 |
| 2032 | 0.502 |
| 2033 | 0.501 |
| 2034 | 0.502 |
| 2035 | 0.502 |
| 2036 | 0.502 |
| 2037 | 0.502 |
| 2038 | 0.502 |
| 2039 | 0.502 |
| 2040 | 0.502 |
| 2041 | 0.502 |
| 2042 | 0.502 |
| 2043 | 0.501 |
| 2044 | 0.501 |
| 2045 | 0.501 |
| 2046 | 0.501 |
| 2047 | 0.501 |
| 2048 | 0.501 |
| 2049 | 0.501 |
| 2050 | 0.502 |
| 2051 | 0.502 |
| 2052 | 0.502 |
| 2053 | 0.502 |
| 2054 | 0.502 |
| 2055 | 0.501 |
| 2056 | 0.501 |
| 2057 | 0.501 |
| 2058 | 0.501 |
| 2059 | 0.501 |
| 2060 | 0.501 |
| 2061 | 0.5 |
| 2062 | 0.5 |
| 2063 | 0.5 |
| 2064 | 0.501 |
| 2065 | 0.5 |
| 2066 | 0.5 |
| 2067 | 0.5 |
| 2068 | 0.501 |
| 2069 | 0.5 |
| 2070 | 0.5 |
| 2071 | 0.5 |
| 2072 | 0.501 |
| 2073 | 0.5 |
| 2074 | 0.501 |
| 2075 | 0.5 |
| 2076 | 0.5 |
| 2077 | 0.5 |
| 2078 | 0.5 |
| 2079 | 0.5 |
| 2080 | 0.5 |
| 2081 | 0.5 |
| 2082 | 0.5 |
| 2083 | 0.5 |
| 2084 | 0.5 |
| 2085 | 0.5 |
| 2086 | 0.499 |
| 2087 | 0.499 |
| 2088 | 0.499 |
| 2089 | 0.499 |
| 2090 | 0.498 |
| 2091 | 0.498 |
| 2092 | 0.498 |
| 2093 | 0.498 |
| 2094 | 0.498 |
| 2095 | 0.498 |
| 2096 | 0.498 |
| 2097 | 0.498 |
| 2098 | 0.498 |
| 2099 | 0.498 |
| 2100 | 0.497 |
| 2101 | 0.497 |
| 2102 | 0.497 |
| 2103 | 0.497 |
| 2104 | 0.497 |
| 2105 | 0.497 |
| 2106 | 0.497 |
| 2107 | 0.497 |
| 2108 | 0.497 |
| 2109 | 0.497 |
| 2110 | 0.497 |
| 2111 | 0.497 |
| 2112 | 0.497 |
| 2113 | 0.497 |
| 2114 | 0.497 |
| 2115 | 0.497 |
| 2116 | 0.497 |
| 2117 | 0.497 |
| 2118 | 0.497 |
| 2119 | 0.497 |
| 2120 | 0.497 |
| 2121 | 0.497 |
| 2122 | 0.497 |
| 2123 | 0.497 |
| 2124 | 0.497 |
| 2125 | 0.497 |
| 2126 | 0.496 |
| 2127 | 0.496 |
| 2128 | 0.496 |
| 2129 | 0.496 |
| 2130 | 0.496 |
| 2131 | 0.495 |
| 2132 | 0.496 |
| 2133 | 0.495 |
| 2134 | 0.495 |
| 2135 | 0.495 |
| 2136 | 0.495 |
| 2137 | 0.495 |
| 2138 | 0.496 |
| 2139 | 0.496 |
| 2140 | 0.496 |
| 2141 | 0.496 |
| 2142 | 0.496 |
| 2143 | 0.496 |
| 2144 | 0.497 |
| 2145 | 0.496 |
| 2146 | 0.497 |
| 2147 | 0.497 |
| 2148 | 0.497 |
| 2149 | 0.497 |
| 2150 | 0.497 |
| 2151 | 0.497 |
| 2152 | 0.497 |
| 2153 | 0.497 |
| 2154 | 0.497 |
| 2155 | 0.497 |
| 2156 | 0.497 |
| 2157 | 0.497 |
| 2158 | 0.497 |
| 2159 | 0.497 |
| 2160 | 0.497 |
| 2161 | 0.497 |
| 2162 | 0.497 |
| 2163 | 0.497 |
| 2164 | 0.497 |
| 2165 | 0.498 |
| 2166 | 0.498 |
| 2167 | 0.498 |
| 2168 | 0.498 |
| 2169 | 0.498 |
| 2170 | 0.498 |
| 2171 | 0.498 |
| 2172 | 0.498 |
| 2173 | 0.498 |
| 2174 | 0.498 |
| 2175 | 0.498 |
| 2176 | 0.498 |
| 2177 | 0.498 |
| 2178 | 0.498 |
| 2179 | 0.498 |
| 2180 | 0.498 |
| 2181 | 0.498 |
| 2182 | 0.498 |
| 2183 | 0.498 |
| 2184 | 0.498 |
| 2185 | 0.498 |
| 2186 | 0.498 |
| 2187 | 0.498 |
| 2188 | 0.498 |
| 2189 | 0.498 |
| 2190 | 0.498 |
| 2191 | 0.498 |
| 2192 | 0.497 |
| 2193 | 0.498 |
| 2194 | 0.498 |
| 2195 | 0.498 |
| 2196 | 0.498 |
| 2197 | 0.498 |
| 2198 | 0.498 |
| 2199 | 0.498 |
| 2200 | 0.498 |
| 2201 | 0.498 |
| 2202 | 0.498 |
| 2203 | 0.498 |
| 2204 | 0.498 |
| 2205 | 0.498 |
| 2206 | 0.498 |
| 2207 | 0.498 |
| 2208 | 0.498 |
| 2209 | 0.498 |
| 2210 | 0.498 |
| 2211 | 0.498 |
| 2212 | 0.498 |
| 2213 | 0.498 |
| 2214 | 0.498 |
| 2215 | 0.498 |
| 2216 | 0.498 |
| 2217 | 0.498 |
| 2218 | 0.498 |
| 2219 | 0.499 |
| 2220 | 0.499 |
| 2221 | 0.499 |
| 2222 | 0.499 |
| 2223 | 0.499 |
| 2224 | 0.499 |
| 2225 | 0.499 |
| 2226 | 0.498 |
| 2227 | 0.498 |
| 2228 | 0.498 |
| 2229 | 0.498 |
| 2230 | 0.498 |
| 2231 | 0.498 |
| 2232 | 0.498 |
| 2233 | 0.498 |
| 2234 | 0.498 |
| 2235 | 0.498 |
| 2236 | 0.498 |
| 2237 | 0.498 |
| 2238 | 0.498 |
| 2239 | 0.498 |
| 2240 | 0.498 |
| 2241 | 0.498 |
| 2242 | 0.498 |
| 2243 | 0.498 |
| 2244 | 0.498 |
| 2245 | 0.499 |
| 2246 | 0.499 |
| 2247 | 0.499 |
| 2248 | 0.499 |
| 2249 | 0.499 |
| 2250 | 0.499 |
| 2251 | 0.499 |
| 2252 | 0.499 |
| 2253 | 0.499 |
| 2254 | 0.498 |
| 2255 | 0.498 |
| 2256 | 0.498 |
| 2257 | 0.498 |
| 2258 | 0.498 |
| 2259 | 0.498 |
| 2260 | 0.498 |
| 2261 | 0.498 |
| 2262 | 0.498 |
| 2263 | 0.498 |
| 2264 | 0.498 |
| 2265 | 0.498 |
| 2266 | 0.498 |
| 2267 | 0.498 |
| 2268 | 0.498 |
| 2269 | 0.499 |
| 2270 | 0.499 |
| 2271 | 0.499 |
| 2272 | 0.499 |
| 2273 | 0.5 |
| 2274 | 0.499 |
| 2275 | 0.5 |
| 2276 | 0.499 |
| 2277 | 0.499 |
| 2278 | 0.499 |
| 2279 | 0.499 |
| 2280 | 0.498 |
| 2281 | 0.499 |
| 2282 | 0.498 |
| 2283 | 0.499 |
| 2284 | 0.499 |
| 2285 | 0.499 |
| 2286 | 0.499 |
| 2287 | 0.499 |
| 2288 | 0.499 |
| 2289 | 0.499 |
| 2290 | 0.498 |
| 2291 | 0.499 |
| 2292 | 0.499 |
| 2293 | 0.499 |
| 2294 | 0.498 |
| 2295 | 0.499 |
| 2296 | 0.498 |
| 2297 | 0.498 |
| 2298 | 0.498 |
| 2299 | 0.498 |
| 2300 | 0.498 |
| 2301 | 0.498 |
| 2302 | 0.498 |
| 2303 | 0.498 |
| 2304 | 0.498 |
| 2305 | 0.498 |
| 2306 | 0.498 |
| 2307 | 0.498 |
| 2308 | 0.498 |
| 2309 | 0.498 |
| 2310 | 0.498 |
| 2311 | 0.498 |
| 2312 | 0.498 |
| 2313 | 0.498 |
| 2314 | 0.498 |
| 2315 | 0.498 |
| 2316 | 0.498 |
| 2317 | 0.498 |
| 2318 | 0.498 |
| 2319 | 0.499 |
| 2320 | 0.498 |
| 2321 | 0.499 |
| 2322 | 0.498 |
| 2323 | 0.499 |
| 2324 | 0.499 |
| 2325 | 0.499 |
| 2326 | 0.499 |
| 2327 | 0.5 |
| 2328 | 0.499 |
| 2329 | 0.499 |
| 2330 | 0.499 |
| 2331 | 0.499 |
| 2332 | 0.499 |
| 2333 | 0.499 |
| 2334 | 0.499 |
| 2335 | 0.499 |
| 2336 | 0.499 |
| 2337 | 0.5 |
| 2338 | 0.499 |
| 2339 | 0.5 |
| 2340 | 0.5 |
| 2341 | 0.5 |
| 2342 | 0.5 |
| 2343 | 0.5 |
| 2344 | 0.5 |
| 2345 | 0.5 |
| 2346 | 0.499 |
| 2347 | 0.5 |
| 2348 | 0.499 |
| 2349 | 0.499 |
| 2350 | 0.499 |
| 2351 | 0.5 |
| 2352 | 0.5 |
| 2353 | 0.5 |
| 2354 | 0.5 |
| 2355 | 0.5 |
| 2356 | 0.5 |
| 2357 | 0.5 |
| 2358 | 0.5 |
| 2359 | 0.5 |
| 2360 | 0.5 |
| 2361 | 0.5 |
| 2362 | 0.5 |
| 2363 | 0.5 |
| 2364 | 0.501 |
| 2365 | 0.5 |
| 2366 | 0.501 |
| 2367 | 0.5 |
| 2368 | 0.501 |
| 2369 | 0.501 |
| 2370 | 0.501 |
| 2371 | 0.501 |
| 2372 | 0.501 |
| 2373 | 0.501 |
| 2374 | 0.501 |
| 2375 | 0.501 |
| 2376 | 0.501 |
| 2377 | 0.501 |
| 2378 | 0.501 |
| 2379 | 0.502 |
| 2380 | 0.501 |
| 2381 | 0.501 |
| 2382 | 0.501 |
| 2383 | 0.501 |
| 2384 | 0.501 |
| 2385 | 0.501 |
| 2386 | 0.501 |
| 2387 | 0.502 |
| 2388 | 0.502 |
| 2389 | 0.502 |
| 2390 | 0.502 |
| 2391 | 0.502 |
| 2392 | 0.501 |
| 2393 | 0.502 |
| 2394 | 0.501 |
| 2395 | 0.501 |
| 2396 | 0.501 |
| 2397 | 0.501 |
| 2398 | 0.501 |
| 2399 | 0.502 |
| 2400 | 0.502 |
| 2401 | 0.502 |
| 2402 | 0.501 |
| 2403 | 0.502 |
| 2404 | 0.502 |
| 2405 | 0.502 |
| 2406 | 0.501 |
| 2407 | 0.501 |
| 2408 | 0.501 |
| 2409 | 0.501 |
| 2410 | 0.501 |
| 2411 | 0.501 |
| 2412 | 0.501 |
| 2413 | 0.501 |
| 2414 | 0.501 |
| 2415 | 0.501 |
| 2416 | 0.501 |
| 2417 | 0.501 |
| 2418 | 0.501 |
| 2419 | 0.501 |
| 2420 | 0.501 |
| 2421 | 0.501 |
| 2422 | 0.501 |
| 2423 | 0.501 |
| 2424 | 0.501 |
| 2425 | 0.502 |
| 2426 | 0.502 |
| 2427 | 0.502 |
| 2428 | 0.501 |
| 2429 | 0.502 |
| 2430 | 0.502 |
| 2431 | 0.502 |
| 2432 | 0.502 |
| 2433 | 0.502 |
| 2434 | 0.501 |
| 2435 | 0.501 |
| 2436 | 0.501 |
| 2437 | 0.501 |
| 2438 | 0.501 |
| 2439 | 0.501 |
| 2440 | 0.501 |
| 2441 | 0.501 |
| 2442 | 0.501 |
| 2443 | 0.5 |
| 2444 | 0.5 |
| 2445 | 0.5 |
| 2446 | 0.501 |
| 2447 | 0.501 |
| 2448 | 0.501 |
| 2449 | 0.501 |
| 2450 | 0.501 |
| 2451 | 0.501 |
| 2452 | 0.501 |
| 2453 | 0.501 |
| 2454 | 0.501 |
| 2455 | 0.501 |
| 2456 | 0.501 |
| 2457 | 0.501 |
| 2458 | 0.501 |
| 2459 | 0.501 |
| 2460 | 0.501 |
| 2461 | 0.501 |
| 2462 | 0.501 |
| 2463 | 0.501 |
| 2464 | 0.501 |
| 2465 | 0.501 |
| 2466 | 0.501 |
| 2467 | 0.501 |
| 2468 | 0.501 |
| 2469 | 0.502 |
| 2470 | 0.501 |
| 2471 | 0.501 |
| 2472 | 0.501 |
| 2473 | 0.501 |
| 2474 | 0.501 |
| 2475 | 0.501 |
| 2476 | 0.501 |
| 2477 | 0.501 |
| 2478 | 0.501 |
| 2479 | 0.501 |
| 2480 | 0.501 |
| 2481 | 0.501 |
| 2482 | 0.501 |
| 2483 | 0.501 |
| 2484 | 0.501 |
| 2485 | 0.5 |
| 2486 | 0.501 |
| 2487 | 0.501 |
| 2488 | 0.501 |
| 2489 | 0.501 |
| 2490 | 0.501 |
| 2491 | 0.501 |
| 2492 | 0.501 |
| 2493 | 0.5 |
| 2494 | 0.501 |
| 2495 | 0.501 |
| 2496 | 0.501 |
| 2497 | 0.501 |
| 2498 | 0.501 |
| 2499 | 0.501 |
| 2500 | 0.501 |
| 2501 | 0.501 |
| 2502 | 0.501 |
| 2503 | 0.501 |
| 2504 | 0.501 |
| 2505 | 0.502 |
| 2506 | 0.501 |
| 2507 | 0.501 |
| 2508 | 0.501 |
| 2509 | 0.501 |
| 2510 | 0.501 |
| 2511 | 0.501 |
| 2512 | 0.501 |
| 2513 | 0.501 |
| 2514 | 0.501 |
| 2515 | 0.501 |
| 2516 | 0.501 |
| 2517 | 0.501 |
| 2518 | 0.501 |
| 2519 | 0.501 |
| 2520 | 0.501 |
| 2521 | 0.502 |
| 2522 | 0.502 |
| 2523 | 0.502 |
| 2524 | 0.502 |
| 2525 | 0.502 |
| 2526 | 0.502 |
| 2527 | 0.502 |
| 2528 | 0.503 |
| 2529 | 0.502 |
| 2530 | 0.503 |
| 2531 | 0.503 |
| 2532 | 0.503 |
| 2533 | 0.503 |
| 2534 | 0.503 |
| 2535 | 0.502 |
| 2536 | 0.502 |
| 2537 | 0.502 |
| 2538 | 0.502 |
| 2539 | 0.502 |
| 2540 | 0.502 |
| 2541 | 0.502 |
| 2542 | 0.502 |
| 2543 | 0.502 |
| 2544 | 0.502 |
| 2545 | 0.502 |
| 2546 | 0.503 |
| 2547 | 0.503 |
| 2548 | 0.503 |
| 2549 | 0.502 |
| 2550 | 0.503 |
| 2551 | 0.503 |
| 2552 | 0.503 |
| 2553 | 0.502 |
| 2554 | 0.502 |
| 2555 | 0.502 |
| 2556 | 0.502 |
| 2557 | 0.502 |
| 2558 | 0.503 |
| 2559 | 0.503 |
| 2560 | 0.503 |
| 2561 | 0.503 |
| 2562 | 0.503 |
| 2563 | 0.503 |
| 2564 | 0.503 |
| 2565 | 0.503 |
| 2566 | 0.503 |
| 2567 | 0.503 |
| 2568 | 0.503 |
| 2569 | 0.502 |
| 2570 | 0.502 |
| 2571 | 0.502 |
| 2572 | 0.502 |
| 2573 | 0.502 |
| 2574 | 0.502 |
| 2575 | 0.502 |
| 2576 | 0.503 |
| 2577 | 0.502 |
| 2578 | 0.503 |
| 2579 | 0.503 |
| 2580 | 0.503 |
| 2581 | 0.503 |
| 2582 | 0.503 |
| 2583 | 0.503 |
| 2584 | 0.503 |
| 2585 | 0.503 |
| 2586 | 0.503 |
| 2587 | 0.503 |
| 2588 | 0.503 |
| 2589 | 0.503 |
| 2590 | 0.503 |
| 2591 | 0.503 |
| 2592 | 0.504 |
| 2593 | 0.504 |
| 2594 | 0.504 |
| 2595 | 0.504 |
| 2596 | 0.504 |
| 2597 | 0.504 |
| 2598 | 0.504 |
| 2599 | 0.503 |
| 2600 | 0.504 |
| 2601 | 0.504 |
| 2602 | 0.504 |
| 2603 | 0.503 |
| 2604 | 0.503 |
| 2605 | 0.503 |
| 2606 | 0.503 |
| 2607 | 0.503 |
| 2608 | 0.502 |
| 2609 | 0.502 |
| 2610 | 0.502 |
| 2611 | 0.502 |
| 2612 | 0.502 |
| 2613 | 0.502 |
| 2614 | 0.502 |
| 2615 | 0.502 |
| 2616 | 0.502 |
| 2617 | 0.502 |
| 2618 | 0.502 |
| 2619 | 0.502 |
| 2620 | 0.502 |
| 2621 | 0.502 |
| 2622 | 0.502 |
| 2623 | 0.502 |
| 2624 | 0.501 |
| 2625 | 0.501 |
| 2626 | 0.501 |
| 2627 | 0.501 |
| 2628 | 0.501 |
| 2629 | 0.5 |
| 2630 | 0.501 |
| 2631 | 0.5 |
| 2632 | 0.501 |
| 2633 | 0.5 |
| 2634 | 0.5 |
| 2635 | 0.5 |
| 2636 | 0.5 |
| 2637 | 0.5 |
| 2638 | 0.5 |
| 2639 | 0.5 |
| 2640 | 0.5 |
| 2641 | 0.5 |
| 2642 | 0.5 |
| 2643 | 0.5 |
| 2644 | 0.5 |
| 2645 | 0.5 |
| 2646 | 0.499 |
| 2647 | 0.499 |
| 2648 | 0.499 |
| 2649 | 0.499 |
| 2650 | 0.499 |
| 2651 | 0.499 |
| 2652 | 0.499 |
| 2653 | 0.499 |
| 2654 | 0.499 |
| 2655 | 0.499 |
| 2656 | 0.499 |
| 2657 | 0.499 |
| 2658 | 0.499 |
| 2659 | 0.499 |
| 2660 | 0.499 |
| 2661 | 0.499 |
| 2662 | 0.499 |
| 2663 | 0.499 |
| 2664 | 0.499 |
| 2665 | 0.499 |
| 2666 | 0.499 |
| 2667 | 0.5 |
| 2668 | 0.5 |
| 2669 | 0.5 |
| 2670 | 0.5 |
| 2671 | 0.5 |
| 2672 | 0.5 |
| 2673 | 0.5 |
| 2674 | 0.5 |
| 2675 | 0.5 |
| 2676 | 0.5 |
| 2677 | 0.5 |
| 2678 | 0.501 |
| 2679 | 0.501 |
| 2680 | 0.501 |
| 2681 | 0.501 |
| 2682 | 0.501 |
| 2683 | 0.501 |
| 2684 | 0.501 |
| 2685 | 0.5 |
| 2686 | 0.501 |
| 2687 | 0.501 |
| 2688 | 0.501 |
| 2689 | 0.501 |
| 2690 | 0.501 |
| 2691 | 0.501 |
| 2692 | 0.501 |
| 2693 | 0.501 |
| 2694 | 0.501 |
| 2695 | 0.501 |
| 2696 | 0.501 |
| 2697 | 0.501 |
| 2698 | 0.501 |
| 2699 | 0.501 |
| 2700 | 0.501 |
| 2701 | 0.501 |
| 2702 | 0.501 |
| 2703 | 0.501 |
| 2704 | 0.501 |
| 2705 | 0.501 |
| 2706 | 0.501 |
| 2707 | 0.501 |
| 2708 | 0.502 |
| 2709 | 0.501 |
| 2710 | 0.501 |
| 2711 | 0.501 |
| 2712 | 0.501 |
| 2713 | 0.501 |
| 2714 | 0.501 |
| 2715 | 0.501 |
| 2716 | 0.502 |
| 2717 | 0.502 |
| 2718 | 0.502 |
| 2719 | 0.502 |
| 2720 | 0.502 |
| 2721 | 0.502 |
| 2722 | 0.502 |
| 2723 | 0.502 |
| 2724 | 0.502 |
| 2725 | 0.503 |
| 2726 | 0.502 |
| 2727 | 0.503 |
| 2728 | 0.502 |
| 2729 | 0.503 |
| 2730 | 0.503 |
| 2731 | 0.503 |
| 2732 | 0.503 |
| 2733 | 0.503 |
| 2734 | 0.503 |
| 2735 | 0.503 |
| 2736 | 0.502 |
| 2737 | 0.502 |
| 2738 | 0.502 |
| 2739 | 0.502 |
| 2740 | 0.502 |
| 2741 | 0.502 |
| 2742 | 0.502 |
| 2743 | 0.502 |
| 2744 | 0.502 |
| 2745 | 0.502 |
| 2746 | 0.502 |
| 2747 | 0.502 |
| 2748 | 0.502 |
| 2749 | 0.503 |
| 2750 | 0.502 |
| 2751 | 0.502 |
| 2752 | 0.502 |
| 2753 | 0.502 |
| 2754 | 0.502 |
| 2755 | 0.503 |
| 2756 | 0.503 |
| 2757 | 0.503 |
| 2758 | 0.503 |
| 2759 | 0.503 |
| 2760 | 0.503 |
| 2761 | 0.503 |
| 2762 | 0.503 |
| 2763 | 0.503 |
| 2764 | 0.503 |
| 2765 | 0.503 |
| 2766 | 0.503 |
| 2767 | 0.503 |
| 2768 | 0.503 |
| 2769 | 0.503 |
| 2770 | 0.503 |
| 2771 | 0.503 |
| 2772 | 0.502 |
| 2773 | 0.503 |
| 2774 | 0.502 |
| 2775 | 0.503 |
| 2776 | 0.503 |
| 2777 | 0.503 |
| 2778 | 0.503 |
| 2779 | 0.503 |
| 2780 | 0.502 |
| 2781 | 0.502 |
| 2782 | 0.502 |
| 2783 | 0.503 |
| 2784 | 0.502 |
| 2785 | 0.503 |
| 2786 | 0.502 |
| 2787 | 0.503 |
| 2788 | 0.502 |
| 2789 | 0.503 |
| 2790 | 0.502 |
| 2791 | 0.503 |
| 2792 | 0.503 |
| 2793 | 0.503 |
| 2794 | 0.503 |
| 2795 | 0.503 |
| 2796 | 0.503 |
| 2797 | 0.503 |
| 2798 | 0.503 |
| 2799 | 0.503 |
| 2800 | 0.503 |
| 2801 | 0.502 |
| 2802 | 0.502 |
| 2803 | 0.502 |
| 2804 | 0.502 |
| 2805 | 0.502 |
| 2806 | 0.502 |
| 2807 | 0.502 |
| 2808 | 0.502 |
| 2809 | 0.502 |
| 2810 | 0.502 |
| 2811 | 0.502 |
| 2812 | 0.502 |
| 2813 | 0.502 |
| 2814 | 0.502 |
| 2815 | 0.502 |
| 2816 | 0.503 |
| 2817 | 0.502 |
| 2818 | 0.503 |
| 2819 | 0.503 |
| 2820 | 0.503 |
| 2821 | 0.503 |
| 2822 | 0.503 |
| 2823 | 0.503 |
| 2824 | 0.503 |
| 2825 | 0.504 |
| 2826 | 0.504 |
| 2827 | 0.504 |
| 2828 | 0.504 |
| 2829 | 0.504 |
| 2830 | 0.504 |
| 2831 | 0.504 |
| 2832 | 0.504 |
| 2833 | 0.504 |
| 2834 | 0.504 |
| 2835 | 0.504 |
| 2836 | 0.504 |
| 2837 | 0.505 |
| 2838 | 0.505 |
| 2839 | 0.505 |
| 2840 | 0.504 |
| 2841 | 0.504 |
| 2842 | 0.504 |
| 2843 | 0.504 |
| 2844 | 0.504 |
| 2845 | 0.504 |
| 2846 | 0.504 |
| 2847 | 0.504 |
| 2848 | 0.504 |
| 2849 | 0.504 |
| 2850 | 0.504 |
| 2851 | 0.505 |
| 2852 | 0.505 |
| 2853 | 0.505 |
| 2854 | 0.505 |
| 2855 | 0.505 |
| 2856 | 0.504 |
| 2857 | 0.504 |
| 2858 | 0.504 |
| 2859 | 0.504 |
| 2860 | 0.504 |
| 2861 | 0.504 |
| 2862 | 0.504 |
| 2863 | 0.504 |
| 2864 | 0.504 |
| 2865 | 0.504 |
| 2866 | 0.504 |
| 2867 | 0.505 |
| 2868 | 0.504 |
| 2869 | 0.504 |
| 2870 | 0.504 |
| 2871 | 0.504 |
| 2872 | 0.504 |
| 2873 | 0.504 |
| 2874 | 0.504 |
| 2875 | 0.505 |
| 2876 | 0.505 |
| 2877 | 0.505 |
| 2878 | 0.505 |
| 2879 | 0.505 |
| 2880 | 0.504 |
| 2881 | 0.505 |
| 2882 | 0.504 |
| 2883 | 0.504 |
| 2884 | 0.504 |
| 2885 | 0.504 |
| 2886 | 0.504 |
| 2887 | 0.504 |
| 2888 | 0.504 |
| 2889 | 0.504 |
| 2890 | 0.504 |
| 2891 | 0.504 |
| 2892 | 0.505 |
| 2893 | 0.504 |
| 2894 | 0.504 |
| 2895 | 0.504 |
| 2896 | 0.504 |
| 2897 | 0.504 |
| 2898 | 0.504 |
| 2899 | 0.504 |
| 2900 | 0.504 |
| 2901 | 0.504 |
| 2902 | 0.505 |
| 2903 | 0.504 |
| 2904 | 0.504 |
| 2905 | 0.504 |
| 2906 | 0.504 |
| 2907 | 0.504 |
| 2908 | 0.505 |
| 2909 | 0.505 |
| 2910 | 0.505 |
| 2911 | 0.504 |
| 2912 | 0.505 |
| 2913 | 0.505 |
| 2914 | 0.505 |
| 2915 | 0.505 |
| 2916 | 0.505 |
| 2917 | 0.505 |
| 2918 | 0.505 |
| 2919 | 0.505 |
| 2920 | 0.505 |
| 2921 | 0.505 |
| 2922 | 0.505 |
| 2923 | 0.505 |
| 2924 | 0.505 |
| 2925 | 0.505 |
| 2926 | 0.505 |
| 2927 | 0.505 |
| 2928 | 0.505 |
| 2929 | 0.505 |
| 2930 | 0.506 |
| 2931 | 0.505 |
| 2932 | 0.506 |
| 2933 | 0.505 |
| 2934 | 0.506 |
| 2935 | 0.506 |
| 2936 | 0.506 |
| 2937 | 0.505 |
| 2938 | 0.505 |
| 2939 | 0.505 |
| 2940 | 0.505 |
| 2941 | 0.505 |
| 2942 | 0.505 |
| 2943 | 0.505 |
| 2944 | 0.505 |
| 2945 | 0.505 |
| 2946 | 0.505 |
| 2947 | 0.505 |
| 2948 | 0.505 |
| 2949 | 0.505 |
| 2950 | 0.505 |
| 2951 | 0.504 |
| 2952 | 0.504 |
| 2953 | 0.504 |
| 2954 | 0.504 |
| 2955 | 0.504 |
| 2956 | 0.504 |
| 2957 | 0.504 |
| 2958 | 0.504 |
| 2959 | 0.504 |
| 2960 | 0.504 |
| 2961 | 0.504 |
| 2962 | 0.504 |
| 2963 | 0.504 |
| 2964 | 0.504 |
| 2965 | 0.504 |
| 2966 | 0.504 |
| 2967 | 0.504 |
| 2968 | 0.504 |
| 2969 | 0.504 |
| 2970 | 0.504 |
| 2971 | 0.504 |
| 2972 | 0.504 |
| 2973 | 0.504 |
| 2974 | 0.504 |
| 2975 | 0.504 |
| 2976 | 0.504 |
| 2977 | 0.504 |
| 2978 | 0.504 |
| 2979 | 0.504 |
| 2980 | 0.504 |
| 2981 | 0.504 |
| 2982 | 0.504 |
| 2983 | 0.504 |
| 2984 | 0.504 |
| 2985 | 0.504 |
| 2986 | 0.504 |
| 2987 | 0.504 |
| 2988 | 0.504 |
| 2989 | 0.504 |
| 2990 | 0.505 |
| 2991 | 0.504 |
| 2992 | 0.505 |
| 2993 | 0.505 |
| 2994 | 0.505 |
| 2995 | 0.504 |
| 2996 | 0.504 |
| 2997 | 0.504 |
| 2998 | 0.504 |
| 2999 | 0.504 |
| 3000 | 0.503 |
| 3001 | 0.503 |
| 3002 | 0.503 |
| 3003 | 0.503 |
| 3004 | 0.503 |
| 3005 | 0.504 |
| 3006 | 0.504 |
| 3007 | 0.504 |
| 3008 | 0.504 |
| 3009 | 0.504 |
| 3010 | 0.504 |
| 3011 | 0.504 |
| 3012 | 0.504 |
| 3013 | 0.504 |
| 3014 | 0.504 |
| 3015 | 0.505 |
| 3016 | 0.505 |
| 3017 | 0.505 |
| 3018 | 0.505 |
| 3019 | 0.505 |
| 3020 | 0.505 |
| 3021 | 0.505 |
| 3022 | 0.505 |
| 3023 | 0.506 |
| 3024 | 0.506 |
| 3025 | 0.506 |
| 3026 | 0.506 |
| 3027 | 0.506 |
| 3028 | 0.506 |
| 3029 | 0.506 |
| 3030 | 0.506 |
| 3031 | 0.506 |
| 3032 | 0.506 |
| 3033 | 0.506 |
| 3034 | 0.506 |
| 3035 | 0.507 |
| 3036 | 0.507 |
| 3037 | 0.507 |
| 3038 | 0.507 |
| 3039 | 0.507 |
| 3040 | 0.507 |
| 3041 | 0.507 |
| 3042 | 0.506 |
| 3043 | 0.507 |
| 3044 | 0.507 |
| 3045 | 0.507 |
| 3046 | 0.507 |
| 3047 | 0.507 |
| 3048 | 0.507 |
| 3049 | 0.507 |
| 3050 | 0.507 |
| 3051 | 0.507 |
| 3052 | 0.507 |
| 3053 | 0.507 |
| 3054 | 0.507 |
| 3055 | 0.507 |
| 3056 | 0.506 |
| 3057 | 0.506 |
| 3058 | 0.506 |
| 3059 | 0.506 |
| 3060 | 0.506 |
| 3061 | 0.506 |
| 3062 | 0.506 |
| 3063 | 0.506 |
| 3064 | 0.506 |
| 3065 | 0.506 |
| 3066 | 0.506 |
| 3067 | 0.507 |
| 3068 | 0.507 |
| 3069 | 0.507 |
| 3070 | 0.507 |
| 3071 | 0.507 |
| 3072 | 0.507 |
| 3073 | 0.507 |
| 3074 | 0.507 |
| 3075 | 0.507 |
| 3076 | 0.507 |
| 3077 | 0.507 |
| 3078 | 0.508 |
| 3079 | 0.507 |
| 3080 | 0.507 |
| 3081 | 0.507 |
| 3082 | 0.507 |
| 3083 | 0.507 |
| 3084 | 0.508 |
| 3085 | 0.508 |
| 3086 | 0.508 |
| 3087 | 0.508 |
| 3088 | 0.508 |
| 3089 | 0.508 |
| 3090 | 0.508 |
| 3091 | 0.508 |
| 3092 | 0.508 |
| 3093 | 0.508 |
| 3094 | 0.508 |
| 3095 | 0.508 |
| 3096 | 0.508 |
| 3097 | 0.508 |
| 3098 | 0.508 |
| 3099 | 0.508 |
| 3100 | 0.508 |
| 3101 | 0.508 |
| 3102 | 0.508 |
| 3103 | 0.508 |
| 3104 | 0.508 |
| 3105 | 0.508 |
| 3106 | 0.508 |
| 3107 | 0.507 |
| 3108 | 0.507 |
| 3109 | 0.507 |
| 3110 | 0.508 |
| 3111 | 0.508 |
| 3112 | 0.508 |
| 3113 | 0.508 |
| 3114 | 0.508 |
| 3115 | 0.508 |
| 3116 | 0.508 |
| 3117 | 0.508 |
| 3118 | 0.508 |
| 3119 | 0.507 |
| 3120 | 0.507 |
| 3121 | 0.507 |
| 3122 | 0.507 |
| 3123 | 0.507 |
| 3124 | 0.507 |
| 3125 | 0.507 |
| 3126 | 0.507 |
| 3127 | 0.506 |
| 3128 | 0.507 |
| 3129 | 0.506 |
| 3130 | 0.506 |
| 3131 | 0.506 |
| 3132 | 0.506 |
| 3133 | 0.506 |
| 3134 | 0.506 |
| 3135 | 0.506 |
| 3136 | 0.506 |
| 3137 | 0.506 |
| 3138 | 0.506 |
| 3139 | 0.506 |
| 3140 | 0.506 |
| 3141 | 0.506 |
| 3142 | 0.506 |
| 3143 | 0.506 |
| 3144 | 0.507 |
| 3145 | 0.506 |
| 3146 | 0.506 |
| 3147 | 0.506 |
| 3148 | 0.506 |
| 3149 | 0.506 |
| 3150 | 0.506 |
| 3151 | 0.506 |
| 3152 | 0.506 |
| 3153 | 0.506 |
| 3154 | 0.506 |
| 3155 | 0.506 |
| 3156 | 0.506 |
| 3157 | 0.506 |
| 3158 | 0.506 |
| 3159 | 0.506 |
| 3160 | 0.506 |
| 3161 | 0.506 |
| 3162 | 0.506 |
| 3163 | 0.505 |
| 3164 | 0.506 |
| 3165 | 0.506 |
| 3166 | 0.506 |
| 3167 | 0.505 |
| 3168 | 0.505 |
| 3169 | 0.505 |
| 3170 | 0.506 |
| 3171 | 0.505 |
| 3172 | 0.506 |
| 3173 | 0.505 |
| 3174 | 0.506 |
| 3175 | 0.505 |
| 3176 | 0.506 |
| 3177 | 0.505 |
| 3178 | 0.505 |
| 3179 | 0.505 |
| 3180 | 0.505 |
| 3181 | 0.505 |
| 3182 | 0.505 |
| 3183 | 0.505 |
| 3184 | 0.505 |
| 3185 | 0.505 |
| 3186 | 0.505 |
| 3187 | 0.505 |
| 3188 | 0.505 |
| 3189 | 0.505 |
| 3190 | 0.505 |
| 3191 | 0.505 |
| 3192 | 0.505 |
| 3193 | 0.504 |
| 3194 | 0.504 |
| 3195 | 0.504 |
| 3196 | 0.504 |
| 3197 | 0.504 |
| 3198 | 0.504 |
| 3199 | 0.504 |
| 3200 | 0.504 |
| 3201 | 0.504 |
| 3202 | 0.505 |
| 3203 | 0.505 |
| 3204 | 0.505 |
| 3205 | 0.505 |
| 3206 | 0.505 |
| 3207 | 0.505 |
| 3208 | 0.505 |
| 3209 | 0.505 |
| 3210 | 0.505 |
| 3211 | 0.505 |
| 3212 | 0.505 |
| 3213 | 0.505 |
| 3214 | 0.505 |
| 3215 | 0.505 |
| 3216 | 0.505 |
| 3217 | 0.505 |
| 3218 | 0.505 |
| 3219 | 0.505 |
| 3220 | 0.505 |
| 3221 | 0.505 |
| 3222 | 0.505 |
| 3223 | 0.505 |
| 3224 | 0.505 |
| 3225 | 0.505 |
| 3226 | 0.505 |
| 3227 | 0.505 |
| 3228 | 0.505 |
| 3229 | 0.505 |
| 3230 | 0.505 |
| 3231 | 0.505 |
| 3232 | 0.505 |
| 3233 | 0.505 |
| 3234 | 0.505 |
| 3235 | 0.505 |
| 3236 | 0.505 |
| 3237 | 0.505 |
| 3238 | 0.505 |
| 3239 | 0.505 |
| 3240 | 0.505 |
| 3241 | 0.505 |
| 3242 | 0.505 |
| 3243 | 0.505 |
| 3244 | 0.505 |
| 3245 | 0.505 |
| 3246 | 0.504 |
| 3247 | 0.505 |
| 3248 | 0.505 |
| 3249 | 0.505 |
| 3250 | 0.505 |
| 3251 | 0.505 |
| 3252 | 0.504 |
| 3253 | 0.505 |
| 3254 | 0.505 |
| 3255 | 0.505 |
| 3256 | 0.505 |
| 3257 | 0.505 |
| 3258 | 0.505 |
| 3259 | 0.505 |
| 3260 | 0.505 |
| 3261 | 0.505 |
| 3262 | 0.505 |
| 3263 | 0.505 |
| 3264 | 0.505 |
| 3265 | 0.505 |
| 3266 | 0.505 |
| 3267 | 0.505 |
| 3268 | 0.505 |
| 3269 | 0.506 |
| 3270 | 0.506 |
| 3271 | 0.506 |
| 3272 | 0.505 |
| 3273 | 0.505 |
| 3274 | 0.505 |
| 3275 | 0.505 |
| 3276 | 0.505 |
| 3277 | 0.505 |
| 3278 | 0.505 |
| 3279 | 0.505 |
| 3280 | 0.505 |
| 3281 | 0.505 |
| 3282 | 0.505 |
| 3283 | 0.505 |
| 3284 | 0.504 |
| 3285 | 0.505 |
| 3286 | 0.504 |
| 3287 | 0.505 |
| 3288 | 0.505 |
| 3289 | 0.505 |
| 3290 | 0.504 |
| 3291 | 0.504 |
| 3292 | 0.504 |
| 3293 | 0.505 |
| 3294 | 0.505 |
| 3295 | 0.505 |
| 3296 | 0.505 |
| 3297 | 0.505 |
| 3298 | 0.505 |
| 3299 | 0.505 |
| 3300 | 0.505 |
| 3301 | 0.505 |
| 3302 | 0.505 |
| 3303 | 0.505 |
| 3304 | 0.505 |
| 3305 | 0.505 |
| 3306 | 0.505 |
| 3307 | 0.505 |
| 3308 | 0.505 |
| 3309 | 0.505 |
| 3310 | 0.505 |
| 3311 | 0.505 |
| 3312 | 0.505 |
| 3313 | 0.505 |
| 3314 | 0.505 |
| 3315 | 0.505 |
| 3316 | 0.505 |
| 3317 | 0.505 |
| 3318 | 0.505 |
| 3319 | 0.505 |
| 3320 | 0.505 |
| 3321 | 0.505 |
| 3322 | 0.505 |
| 3323 | 0.505 |
| 3324 | 0.505 |
| 3325 | 0.505 |
| 3326 | 0.505 |
| 3327 | 0.505 |
| 3328 | 0.505 |
| 3329 | 0.505 |
| 3330 | 0.505 |
| 3331 | 0.505 |
| 3332 | 0.505 |
| 3333 | 0.505 |
| 3334 | 0.505 |
| 3335 | 0.505 |
| 3336 | 0.505 |
| 3337 | 0.505 |
| 3338 | 0.505 |
| 3339 | 0.505 |
| 3340 | 0.505 |
| 3341 | 0.504 |
| 3342 | 0.504 |
| 3343 | 0.504 |
| 3344 | 0.504 |
| 3345 | 0.504 |
| 3346 | 0.504 |
| 3347 | 0.504 |
| 3348 | 0.504 |
| 3349 | 0.504 |
| 3350 | 0.504 |
| 3351 | 0.504 |
| 3352 | 0.504 |
| 3353 | 0.504 |
| 3354 | 0.503 |
| 3355 | 0.504 |
| 3356 | 0.504 |
| 3357 | 0.504 |
| 3358 | 0.504 |
| 3359 | 0.504 |
| 3360 | 0.504 |
| 3361 | 0.504 |
| 3362 | 0.504 |
| 3363 | 0.504 |
| 3364 | 0.504 |
| 3365 | 0.504 |
| 3366 | 0.505 |
| 3367 | 0.505 |
| 3368 | 0.505 |
| 3369 | 0.504 |
| 3370 | 0.504 |
| 3371 | 0.504 |
| 3372 | 0.504 |
| 3373 | 0.504 |
| 3374 | 0.504 |
| 3375 | 0.504 |
| 3376 | 0.504 |
| 3377 | 0.504 |
| 3378 | 0.504 |
| 3379 | 0.504 |
| 3380 | 0.504 |
| 3381 | 0.504 |
| 3382 | 0.504 |
| 3383 | 0.504 |
| 3384 | 0.504 |
| 3385 | 0.504 |
| 3386 | 0.505 |
| 3387 | 0.505 |
| 3388 | 0.505 |
| 3389 | 0.505 |
| 3390 | 0.505 |
| 3391 | 0.505 |
| 3392 | 0.505 |
| 3393 | 0.505 |
| 3394 | 0.505 |
| 3395 | 0.505 |
| 3396 | 0.505 |
| 3397 | 0.505 |
| 3398 | 0.505 |
| 3399 | 0.505 |
| 3400 | 0.505 |
| 3401 | 0.504 |
| 3402 | 0.504 |
| 3403 | 0.504 |
| 3404 | 0.504 |
| 3405 | 0.504 |
| 3406 | 0.504 |
| 3407 | 0.504 |
| 3408 | 0.504 |
| 3409 | 0.504 |
| 3410 | 0.504 |
| 3411 | 0.504 |
| 3412 | 0.503 |
| 3413 | 0.504 |
| 3414 | 0.504 |
| 3415 | 0.504 |
| 3416 | 0.504 |
| 3417 | 0.504 |
| 3418 | 0.504 |
| 3419 | 0.504 |
| 3420 | 0.504 |
| 3421 | 0.504 |
| 3422 | 0.504 |
| 3423 | 0.504 |
| 3424 | 0.504 |
| 3425 | 0.504 |
| 3426 | 0.503 |
| 3427 | 0.504 |
| 3428 | 0.503 |
| 3429 | 0.503 |
| 3430 | 0.504 |
| 3431 | 0.503 |
| 3432 | 0.503 |
| 3433 | 0.503 |
| 3434 | 0.503 |
| 3435 | 0.503 |
| 3436 | 0.503 |
| 3437 | 0.503 |
| 3438 | 0.503 |
| 3439 | 0.503 |
| 3440 | 0.503 |
| 3441 | 0.503 |
| 3442 | 0.503 |
| 3443 | 0.503 |
| 3444 | 0.503 |
| 3445 | 0.503 |
| 3446 | 0.504 |
| 3447 | 0.504 |
| 3448 | 0.504 |
| 3449 | 0.504 |
| 3450 | 0.504 |
| 3451 | 0.504 |
| 3452 | 0.504 |
| 3453 | 0.504 |
| 3454 | 0.504 |
| 3455 | 0.504 |
| 3456 | 0.504 |
| 3457 | 0.504 |
| 3458 | 0.504 |
| 3459 | 0.504 |
| 3460 | 0.504 |
| 3461 | 0.504 |
| 3462 | 0.504 |
| 3463 | 0.504 |
| 3464 | 0.504 |
| 3465 | 0.504 |
| 3466 | 0.504 |
| 3467 | 0.504 |
| 3468 | 0.504 |
| 3469 | 0.504 |
| 3470 | 0.504 |
| 3471 | 0.504 |
| 3472 | 0.504 |
| 3473 | 0.504 |
| 3474 | 0.504 |
| 3475 | 0.504 |
| 3476 | 0.504 |
| 3477 | 0.504 |
| 3478 | 0.504 |
| 3479 | 0.504 |
| 3480 | 0.504 |
| 3481 | 0.504 |
| 3482 | 0.504 |
| 3483 | 0.504 |
| 3484 | 0.504 |
| 3485 | 0.504 |
| 3486 | 0.504 |
| 3487 | 0.504 |
| 3488 | 0.504 |
| 3489 | 0.504 |
| 3490 | 0.504 |
| 3491 | 0.504 |
| 3492 | 0.504 |
| 3493 | 0.504 |
| 3494 | 0.504 |
| 3495 | 0.504 |
| 3496 | 0.504 |
| 3497 | 0.504 |
| 3498 | 0.504 |
| 3499 | 0.504 |
| 3500 | 0.504 |
| 3501 | 0.504 |
| 3502 | 0.504 |
| 3503 | 0.504 |
| 3504 | 0.504 |
| 3505 | 0.504 |
| 3506 | 0.504 |
| 3507 | 0.504 |
| 3508 | 0.504 |
| 3509 | 0.504 |
| 3510 | 0.504 |
| 3511 | 0.504 |
| 3512 | 0.504 |
| 3513 | 0.504 |
| 3514 | 0.504 |
| 3515 | 0.504 |
| 3516 | 0.504 |
| 3517 | 0.504 |
| 3518 | 0.504 |
| 3519 | 0.504 |
| 3520 | 0.504 |
| 3521 | 0.504 |
| 3522 | 0.504 |
| 3523 | 0.504 |
| 3524 | 0.504 |
| 3525 | 0.504 |
| 3526 | 0.504 |
| 3527 | 0.504 |
| 3528 | 0.504 |
| 3529 | 0.504 |
| 3530 | 0.504 |
| 3531 | 0.504 |
| 3532 | 0.504 |
| 3533 | 0.504 |
| 3534 | 0.504 |
| 3535 | 0.504 |
| 3536 | 0.504 |
| 3537 | 0.504 |
| 3538 | 0.504 |
| 3539 | 0.504 |
| 3540 | 0.504 |
| 3541 | 0.503 |
| 3542 | 0.503 |
| 3543 | 0.503 |
| 3544 | 0.504 |
| 3545 | 0.503 |
| 3546 | 0.503 |
| 3547 | 0.503 |
| 3548 | 0.503 |
| 3549 | 0.503 |
| 3550 | 0.503 |
| 3551 | 0.503 |
| 3552 | 0.503 |
| 3553 | 0.503 |
| 3554 | 0.503 |
| 3555 | 0.503 |
| 3556 | 0.503 |
| 3557 | 0.503 |
| 3558 | 0.503 |
| 3559 | 0.503 |
| 3560 | 0.503 |
| 3561 | 0.503 |
| 3562 | 0.503 |
| 3563 | 0.503 |
| 3564 | 0.504 |
| 3565 | 0.504 |
| 3566 | 0.504 |
| 3567 | 0.504 |
| 3568 | 0.504 |
| 3569 | 0.504 |
| 3570 | 0.504 |
| 3571 | 0.504 |
| 3572 | 0.504 |
| 3573 | 0.504 |
| 3574 | 0.504 |
| 3575 | 0.504 |
| 3576 | 0.504 |
| 3577 | 0.504 |
| 3578 | 0.504 |
| 3579 | 0.504 |
| 3580 | 0.504 |
| 3581 | 0.504 |
| 3582 | 0.504 |
| 3583 | 0.504 |
| 3584 | 0.504 |
| 3585 | 0.504 |
| 3586 | 0.504 |
| 3587 | 0.504 |
| 3588 | 0.504 |
| 3589 | 0.504 |
| 3590 | 0.504 |
| 3591 | 0.504 |
| 3592 | 0.504 |
| 3593 | 0.504 |
| 3594 | 0.504 |
| 3595 | 0.504 |
| 3596 | 0.504 |
| 3597 | 0.504 |
| 3598 | 0.504 |
| 3599 | 0.504 |
| 3600 | 0.504 |
| 3601 | 0.504 |
| 3602 | 0.503 |
| 3603 | 0.504 |
| 3604 | 0.504 |
| 3605 | 0.504 |
| 3606 | 0.503 |
| 3607 | 0.504 |
| 3608 | 0.503 |
| 3609 | 0.504 |
| 3610 | 0.503 |
| 3611 | 0.503 |
| 3612 | 0.503 |
| 3613 | 0.504 |
| 3614 | 0.503 |
| 3615 | 0.503 |
| 3616 | 0.503 |
| 3617 | 0.503 |
| 3618 | 0.503 |
| 3619 | 0.503 |
| 3620 | 0.503 |
| 3621 | 0.503 |
| 3622 | 0.503 |
| 3623 | 0.503 |
| 3624 | 0.503 |
| 3625 | 0.503 |
| 3626 | 0.503 |
| 3627 | 0.503 |
| 3628 | 0.503 |
| 3629 | 0.503 |
| 3630 | 0.503 |
| 3631 | 0.503 |
| 3632 | 0.503 |
| 3633 | 0.504 |
| 3634 | 0.504 |
| 3635 | 0.504 |
| 3636 | 0.504 |
| 3637 | 0.504 |
| 3638 | 0.504 |
| 3639 | 0.504 |
| 3640 | 0.505 |
| 3641 | 0.505 |
| 3642 | 0.505 |
| 3643 | 0.505 |
| 3644 | 0.505 |
| 3645 | 0.505 |
| 3646 | 0.505 |
| 3647 | 0.505 |
| 3648 | 0.505 |
| 3649 | 0.505 |
| 3650 | 0.505 |
| 3651 | 0.505 |
| 3652 | 0.505 |
| 3653 | 0.505 |
| 3654 | 0.505 |
| 3655 | 0.505 |
| 3656 | 0.505 |
| 3657 | 0.505 |
| 3658 | 0.505 |
| 3659 | 0.505 |
| 3660 | 0.505 |
| 3661 | 0.505 |
| 3662 | 0.505 |
| 3663 | 0.505 |
| 3664 | 0.505 |
| 3665 | 0.505 |
| 3666 | 0.505 |
| 3667 | 0.505 |
| 3668 | 0.505 |
| 3669 | 0.505 |
| 3670 | 0.505 |
| 3671 | 0.505 |
| 3672 | 0.505 |
| 3673 | 0.505 |
| 3674 | 0.505 |
| 3675 | 0.505 |
| 3676 | 0.505 |
| 3677 | 0.505 |
| 3678 | 0.506 |
| 3679 | 0.505 |
| 3680 | 0.505 |
| 3681 | 0.505 |
| 3682 | 0.506 |
| 3683 | 0.505 |
| 3684 | 0.506 |
| 3685 | 0.506 |
| 3686 | 0.506 |
| 3687 | 0.506 |
| 3688 | 0.506 |
| 3689 | 0.506 |
| 3690 | 0.506 |
| 3691 | 0.505 |
| 3692 | 0.505 |
| 3693 | 0.505 |
| 3694 | 0.505 |
| 3695 | 0.505 |
| 3696 | 0.505 |
| 3697 | 0.505 |
| 3698 | 0.505 |
| 3699 | 0.505 |
| 3700 | 0.505 |
| 3701 | 0.505 |
| 3702 | 0.505 |
| 3703 | 0.505 |
| 3704 | 0.505 |
| 3705 | 0.505 |
| 3706 | 0.504 |
| 3707 | 0.504 |
| 3708 | 0.504 |
| 3709 | 0.504 |
| 3710 | 0.504 |
| 3711 | 0.504 |
| 3712 | 0.504 |
| 3713 | 0.504 |
| 3714 | 0.504 |
| 3715 | 0.505 |
| 3716 | 0.505 |
| 3717 | 0.505 |
| 3718 | 0.504 |
| 3719 | 0.504 |
| 3720 | 0.504 |
| 3721 | 0.505 |
| 3722 | 0.505 |
| 3723 | 0.505 |
| 3724 | 0.505 |
| 3725 | 0.505 |
| 3726 | 0.505 |
| 3727 | 0.505 |
| 3728 | 0.505 |
| 3729 | 0.505 |
| 3730 | 0.505 |
| 3731 | 0.505 |
| 3732 | 0.505 |
| 3733 | 0.505 |
| 3734 | 0.505 |
| 3735 | 0.505 |
| 3736 | 0.505 |
| 3737 | 0.505 |
| 3738 | 0.505 |
| 3739 | 0.505 |
| 3740 | 0.505 |
| 3741 | 0.505 |
| 3742 | 0.505 |
| 3743 | 0.505 |
| 3744 | 0.505 |
| 3745 | 0.505 |
| 3746 | 0.505 |
| 3747 | 0.505 |
| 3748 | 0.505 |
| 3749 | 0.505 |
| 3750 | 0.505 |
| 3751 | 0.505 |
| 3752 | 0.505 |
| 3753 | 0.505 |
| 3754 | 0.505 |
| 3755 | 0.505 |
| 3756 | 0.504 |
| 3757 | 0.504 |
| 3758 | 0.504 |
| 3759 | 0.504 |
| 3760 | 0.504 |
| 3761 | 0.504 |
| 3762 | 0.504 |
| 3763 | 0.504 |
| 3764 | 0.504 |
| 3765 | 0.504 |
| 3766 | 0.504 |
| 3767 | 0.504 |
| 3768 | 0.504 |
| 3769 | 0.504 |
| 3770 | 0.504 |
| 3771 | 0.504 |
| 3772 | 0.504 |
| 3773 | 0.504 |
| 3774 | 0.504 |
| 3775 | 0.504 |
| 3776 | 0.504 |
| 3777 | 0.504 |
| 3778 | 0.504 |
| 3779 | 0.504 |
| 3780 | 0.504 |
| 3781 | 0.504 |
| 3782 | 0.504 |
| 3783 | 0.504 |
| 3784 | 0.504 |
| 3785 | 0.504 |
| 3786 | 0.504 |
| 3787 | 0.504 |
| 3788 | 0.504 |
| 3789 | 0.504 |
| 3790 | 0.504 |
| 3791 | 0.504 |
| 3792 | 0.504 |
| 3793 | 0.504 |
| 3794 | 0.504 |
| 3795 | 0.504 |
| 3796 | 0.504 |
| 3797 | 0.504 |
| 3798 | 0.504 |
| 3799 | 0.504 |
| 3800 | 0.504 |
| 3801 | 0.504 |
| 3802 | 0.504 |
| 3803 | 0.504 |
| 3804 | 0.504 |
| 3805 | 0.504 |
| 3806 | 0.504 |
| 3807 | 0.504 |
| 3808 | 0.504 |
| 3809 | 0.504 |
| 3810 | 0.504 |
| 3811 | 0.504 |
| 3812 | 0.504 |
| 3813 | 0.504 |
| 3814 | 0.504 |
| 3815 | 0.504 |
| 3816 | 0.504 |
| 3817 | 0.504 |
| 3818 | 0.504 |
| 3819 | 0.504 |
| 3820 | 0.504 |
| 3821 | 0.504 |
| 3822 | 0.504 |
| 3823 | 0.504 |
| 3824 | 0.504 |
| 3825 | 0.504 |
| 3826 | 0.504 |
| 3827 | 0.503 |
| 3828 | 0.503 |
| 3829 | 0.503 |
| 3830 | 0.503 |
| 3831 | 0.503 |
| 3832 | 0.503 |
| 3833 | 0.503 |
| 3834 | 0.503 |
| 3835 | 0.503 |
| 3836 | 0.503 |
| 3837 | 0.503 |
| 3838 | 0.503 |
| 3839 | 0.503 |
| 3840 | 0.503 |
| 3841 | 0.503 |
| 3842 | 0.503 |
| 3843 | 0.503 |
| 3844 | 0.503 |
| 3845 | 0.503 |
| 3846 | 0.503 |
| 3847 | 0.503 |
| 3848 | 0.503 |
| 3849 | 0.503 |
| 3850 | 0.503 |
| 3851 | 0.503 |
| 3852 | 0.503 |
| 3853 | 0.503 |
| 3854 | 0.503 |
| 3855 | 0.503 |
| 3856 | 0.503 |
| 3857 | 0.503 |
| 3858 | 0.503 |
| 3859 | 0.503 |
| 3860 | 0.503 |
| 3861 | 0.504 |
| 3862 | 0.504 |
| 3863 | 0.504 |
| 3864 | 0.504 |
| 3865 | 0.504 |
| 3866 | 0.503 |
| 3867 | 0.504 |
| 3868 | 0.504 |
| 3869 | 0.504 |
| 3870 | 0.504 |
| 3871 | 0.504 |
| 3872 | 0.504 |
| 3873 | 0.504 |
| 3874 | 0.504 |
| 3875 | 0.504 |
| 3876 | 0.504 |
| 3877 | 0.504 |
| 3878 | 0.504 |
| 3879 | 0.504 |
| 3880 | 0.504 |
| 3881 | 0.504 |
| 3882 | 0.504 |
| 3883 | 0.504 |
| 3884 | 0.504 |
| 3885 | 0.504 |
| 3886 | 0.504 |
| 3887 | 0.504 |
| 3888 | 0.504 |
| 3889 | 0.504 |
| 3890 | 0.504 |
| 3891 | 0.504 |
| 3892 | 0.504 |
| 3893 | 0.504 |
| 3894 | 0.504 |
| 3895 | 0.504 |
| 3896 | 0.504 |
| 3897 | 0.504 |
| 3898 | 0.504 |
| 3899 | 0.504 |
| 3900 | 0.504 |
| 3901 | 0.504 |
| 3902 | 0.504 |
| 3903 | 0.504 |
| 3904 | 0.503 |
| 3905 | 0.503 |
| 3906 | 0.503 |
| 3907 | 0.503 |
| 3908 | 0.503 |
| 3909 | 0.504 |
| 3910 | 0.503 |
| 3911 | 0.504 |
| 3912 | 0.504 |
| 3913 | 0.504 |
| 3914 | 0.503 |
| 3915 | 0.503 |
| 3916 | 0.503 |
| 3917 | 0.503 |
| 3918 | 0.503 |
| 3919 | 0.503 |
| 3920 | 0.503 |
| 3921 | 0.503 |
| 3922 | 0.503 |
| 3923 | 0.503 |
| 3924 | 0.503 |
| 3925 | 0.503 |
| 3926 | 0.503 |
| 3927 | 0.503 |
| 3928 | 0.503 |
| 3929 | 0.503 |
| 3930 | 0.503 |
| 3931 | 0.503 |
| 3932 | 0.503 |
| 3933 | 0.503 |
| 3934 | 0.503 |
| 3935 | 0.503 |
| 3936 | 0.503 |
| 3937 | 0.503 |
| 3938 | 0.502 |
| 3939 | 0.503 |
| 3940 | 0.502 |
| 3941 | 0.502 |
| 3942 | 0.502 |
| 3943 | 0.502 |
| 3944 | 0.502 |
| 3945 | 0.503 |
| 3946 | 0.503 |
| 3947 | 0.503 |
| 3948 | 0.503 |
| 3949 | 0.503 |
| 3950 | 0.502 |
| 3951 | 0.503 |
| 3952 | 0.503 |
| 3953 | 0.503 |
| 3954 | 0.503 |
| 3955 | 0.503 |
| 3956 | 0.502 |
| 3957 | 0.503 |
| 3958 | 0.503 |
| 3959 | 0.503 |
| 3960 | 0.503 |
| 3961 | 0.503 |
| 3962 | 0.503 |
| 3963 | 0.503 |
| 3964 | 0.503 |
| 3965 | 0.503 |
| 3966 | 0.502 |
| 3967 | 0.503 |
| 3968 | 0.503 |
| 3969 | 0.503 |
| 3970 | 0.503 |
| 3971 | 0.503 |
| 3972 | 0.503 |
| 3973 | 0.503 |
| 3974 | 0.503 |
| 3975 | 0.503 |
| 3976 | 0.503 |
| 3977 | 0.503 |
| 3978 | 0.503 |
| 3979 | 0.503 |
| 3980 | 0.503 |
| 3981 | 0.503 |
| 3982 | 0.503 |
| 3983 | 0.503 |
| 3984 | 0.503 |
| 3985 | 0.503 |
| 3986 | 0.503 |
| 3987 | 0.503 |
| 3988 | 0.503 |
| 3989 | 0.504 |
| 3990 | 0.504 |
| 3991 | 0.504 |
| 3992 | 0.504 |
| 3993 | 0.504 |
| 3994 | 0.504 |
| 3995 | 0.504 |
| 3996 | 0.504 |
| 3997 | 0.504 |
| 3998 | 0.504 |
| 3999 | 0.504 |
| 4000 | 0.504 |
| 4001 | 0.504 |
| 4002 | 0.504 |
| 4003 | 0.504 |
| 4004 | 0.504 |
| 4005 | 0.504 |
| 4006 | 0.504 |
| 4007 | 0.504 |
| 4008 | 0.504 |
| 4009 | 0.504 |
| 4010 | 0.504 |
| 4011 | 0.504 |
| 4012 | 0.504 |
| 4013 | 0.504 |
| 4014 | 0.504 |
| 4015 | 0.504 |
| 4016 | 0.504 |
| 4017 | 0.504 |
| 4018 | 0.504 |
| 4019 | 0.504 |
| 4020 | 0.504 |
| 4021 | 0.504 |
| 4022 | 0.504 |
| 4023 | 0.503 |
| 4024 | 0.503 |
| 4025 | 0.503 |
| 4026 | 0.503 |
| 4027 | 0.503 |
| 4028 | 0.503 |
| 4029 | 0.503 |
| 4030 | 0.503 |
| 4031 | 0.503 |
| 4032 | 0.503 |
| 4033 | 0.503 |
| 4034 | 0.503 |
| 4035 | 0.503 |
| 4036 | 0.503 |
| 4037 | 0.503 |
| 4038 | 0.503 |
| 4039 | 0.503 |
| 4040 | 0.503 |
| 4041 | 0.503 |
| 4042 | 0.503 |
| 4043 | 0.503 |
| 4044 | 0.503 |
| 4045 | 0.503 |
| 4046 | 0.503 |
| 4047 | 0.503 |
| 4048 | 0.503 |
| 4049 | 0.503 |
| 4050 | 0.503 |
| 4051 | 0.503 |
| 4052 | 0.503 |
| 4053 | 0.503 |
| 4054 | 0.503 |
| 4055 | 0.503 |
| 4056 | 0.503 |
| 4057 | 0.503 |
| 4058 | 0.503 |
| 4059 | 0.503 |
| 4060 | 0.503 |
| 4061 | 0.503 |
| 4062 | 0.503 |
| 4063 | 0.503 |
| 4064 | 0.503 |
| 4065 | 0.503 |
| 4066 | 0.504 |
| 4067 | 0.504 |
| 4068 | 0.504 |
| 4069 | 0.504 |
| 4070 | 0.504 |
| 4071 | 0.504 |
| 4072 | 0.504 |
| 4073 | 0.504 |
| 4074 | 0.504 |
| 4075 | 0.504 |
| 4076 | 0.504 |
| 4077 | 0.504 |
| 4078 | 0.504 |
| 4079 | 0.504 |
| 4080 | 0.504 |
| 4081 | 0.503 |
| 4082 | 0.503 |
| 4083 | 0.503 |
| 4084 | 0.503 |
| 4085 | 0.503 |
| 4086 | 0.503 |
| 4087 | 0.503 |
| 4088 | 0.503 |
| 4089 | 0.503 |
| 4090 | 0.503 |
| 4091 | 0.503 |
| 4092 | 0.503 |
| 4093 | 0.503 |
| 4094 | 0.503 |
| 4095 | 0.503 |
| 4096 | 0.504 |
| 4097 | 0.503 |
| 4098 | 0.504 |
| 4099 | 0.503 |
| 4100 | 0.504 |
| 4101 | 0.504 |
| 4102 | 0.504 |
| 4103 | 0.503 |
| 4104 | 0.503 |
| 4105 | 0.503 |
| 4106 | 0.503 |
| 4107 | 0.503 |
| 4108 | 0.503 |
| 4109 | 0.503 |
| 4110 | 0.503 |
| 4111 | 0.503 |
| 4112 | 0.503 |
| 4113 | 0.503 |
| 4114 | 0.503 |
| 4115 | 0.502 |
| 4116 | 0.502 |
| 4117 | 0.502 |
| 4118 | 0.502 |
| 4119 | 0.502 |
| 4120 | 0.502 |
| 4121 | 0.502 |
| 4122 | 0.502 |
| 4123 | 0.502 |
| 4124 | 0.502 |
| 4125 | 0.502 |
| 4126 | 0.502 |
| 4127 | 0.502 |
| 4128 | 0.502 |
| 4129 | 0.502 |
| 4130 | 0.502 |
| 4131 | 0.502 |
| 4132 | 0.502 |
| 4133 | 0.502 |
| 4134 | 0.502 |
| 4135 | 0.502 |
| 4136 | 0.502 |
| 4137 | 0.502 |
| 4138 | 0.502 |
| 4139 | 0.502 |
| 4140 | 0.502 |
| 4141 | 0.502 |
| 4142 | 0.502 |
| 4143 | 0.502 |
| 4144 | 0.502 |
| 4145 | 0.502 |
| 4146 | 0.502 |
| 4147 | 0.502 |
| 4148 | 0.502 |
| 4149 | 0.502 |
| 4150 | 0.502 |
| 4151 | 0.502 |
| 4152 | 0.502 |
| 4153 | 0.502 |
| 4154 | 0.502 |
| 4155 | 0.502 |
| 4156 | 0.502 |
| 4157 | 0.502 |
| 4158 | 0.502 |
| 4159 | 0.502 |
| 4160 | 0.502 |
| 4161 | 0.502 |
| 4162 | 0.502 |
| 4163 | 0.502 |
| 4164 | 0.502 |
| 4165 | 0.502 |
| 4166 | 0.502 |
| 4167 | 0.502 |
| 4168 | 0.502 |
| 4169 | 0.502 |
| 4170 | 0.502 |
| 4171 | 0.502 |
| 4172 | 0.502 |
| 4173 | 0.502 |
| 4174 | 0.502 |
| 4175 | 0.501 |
| 4176 | 0.501 |
| 4177 | 0.501 |
| 4178 | 0.501 |
| 4179 | 0.501 |
| 4180 | 0.501 |
| 4181 | 0.501 |
| 4182 | 0.501 |
| 4183 | 0.501 |
| 4184 | 0.501 |
| 4185 | 0.501 |
| 4186 | 0.501 |
| 4187 | 0.501 |
| 4188 | 0.502 |
| 4189 | 0.501 |
| 4190 | 0.501 |
| 4191 | 0.501 |
| 4192 | 0.502 |
| 4193 | 0.501 |
| 4194 | 0.501 |
| 4195 | 0.501 |
| 4196 | 0.502 |
| 4197 | 0.502 |
| 4198 | 0.502 |
| 4199 | 0.502 |
| 4200 | 0.502 |
| 4201 | 0.502 |
| 4202 | 0.502 |
| 4203 | 0.502 |
| 4204 | 0.502 |
| 4205 | 0.502 |
| 4206 | 0.502 |
| 4207 | 0.502 |
| 4208 | 0.502 |
| 4209 | 0.502 |
| 4210 | 0.502 |
| 4211 | 0.502 |
| 4212 | 0.502 |
| 4213 | 0.502 |
| 4214 | 0.502 |
| 4215 | 0.502 |
| 4216 | 0.502 |
| 4217 | 0.502 |
| 4218 | 0.502 |
| 4219 | 0.502 |
| 4220 | 0.502 |
| 4221 | 0.502 |
| 4222 | 0.502 |
| 4223 | 0.502 |
| 4224 | 0.502 |
| 4225 | 0.502 |
| 4226 | 0.502 |
| 4227 | 0.502 |
| 4228 | 0.502 |
| 4229 | 0.502 |
| 4230 | 0.502 |
| 4231 | 0.502 |
| 4232 | 0.502 |
| 4233 | 0.502 |
| 4234 | 0.502 |
| 4235 | 0.502 |
| 4236 | 0.502 |
| 4237 | 0.502 |
| 4238 | 0.502 |
| 4239 | 0.502 |
| 4240 | 0.502 |
| 4241 | 0.502 |
| 4242 | 0.502 |
| 4243 | 0.502 |
| 4244 | 0.502 |
| 4245 | 0.502 |
| 4246 | 0.502 |
| 4247 | 0.502 |
| 4248 | 0.502 |
| 4249 | 0.502 |
| 4250 | 0.502 |
| 4251 | 0.502 |
| 4252 | 0.502 |
| 4253 | 0.502 |
| 4254 | 0.502 |
| 4255 | 0.502 |
| 4256 | 0.502 |
| 4257 | 0.502 |
| 4258 | 0.502 |
| 4259 | 0.502 |
| 4260 | 0.502 |
| 4261 | 0.502 |
| 4262 | 0.502 |
| 4263 | 0.502 |
| 4264 | 0.502 |
| 4265 | 0.502 |
| 4266 | 0.502 |
| 4267 | 0.502 |
| 4268 | 0.502 |
| 4269 | 0.502 |
| 4270 | 0.502 |
| 4271 | 0.502 |
| 4272 | 0.502 |
| 4273 | 0.502 |
| 4274 | 0.502 |
| 4275 | 0.502 |
| 4276 | 0.502 |
| 4277 | 0.502 |
| 4278 | 0.502 |
| 4279 | 0.503 |
| 4280 | 0.502 |
| 4281 | 0.502 |
| 4282 | 0.502 |
| 4283 | 0.502 |
| 4284 | 0.502 |
| 4285 | 0.502 |
| 4286 | 0.502 |
| 4287 | 0.502 |
| 4288 | 0.502 |
| 4289 | 0.502 |
| 4290 | 0.502 |
| 4291 | 0.502 |
| 4292 | 0.502 |
| 4293 | 0.503 |
| 4294 | 0.503 |
| 4295 | 0.503 |
| 4296 | 0.502 |
| 4297 | 0.503 |
| 4298 | 0.503 |
| 4299 | 0.503 |
| 4300 | 0.503 |
| 4301 | 0.503 |
| 4302 | 0.502 |
| 4303 | 0.503 |
| 4304 | 0.503 |
| 4305 | 0.503 |
| 4306 | 0.503 |
| 4307 | 0.503 |
| 4308 | 0.503 |
| 4309 | 0.503 |
| 4310 | 0.503 |
| 4311 | 0.503 |
| 4312 | 0.503 |
| 4313 | 0.503 |
| 4314 | 0.503 |
| 4315 | 0.503 |
| 4316 | 0.503 |
| 4317 | 0.503 |
| 4318 | 0.503 |
| 4319 | 0.503 |
| 4320 | 0.503 |
| 4321 | 0.503 |
| 4322 | 0.503 |
| 4323 | 0.503 |
| 4324 | 0.503 |
| 4325 | 0.503 |
| 4326 | 0.502 |
| 4327 | 0.503 |
| 4328 | 0.503 |
| 4329 | 0.503 |
| 4330 | 0.502 |
| 4331 | 0.502 |
| 4332 | 0.502 |
| 4333 | 0.502 |
| 4334 | 0.502 |
| 4335 | 0.503 |
| 4336 | 0.503 |
| 4337 | 0.503 |
| 4338 | 0.503 |
| 4339 | 0.503 |
| 4340 | 0.503 |
| 4341 | 0.503 |
| 4342 | 0.502 |
| 4343 | 0.503 |
| 4344 | 0.503 |
| 4345 | 0.503 |
| 4346 | 0.503 |
| 4347 | 0.503 |
| 4348 | 0.503 |
| 4349 | 0.503 |
| 4350 | 0.503 |
| 4351 | 0.503 |
| 4352 | 0.503 |
| 4353 | 0.503 |
| 4354 | 0.503 |
| 4355 | 0.503 |
| 4356 | 0.503 |
| 4357 | 0.503 |
| 4358 | 0.503 |
| 4359 | 0.503 |
| 4360 | 0.503 |
| 4361 | 0.503 |
| 4362 | 0.503 |
| 4363 | 0.503 |
| 4364 | 0.502 |
| 4365 | 0.502 |
| 4366 | 0.502 |
| 4367 | 0.503 |
| 4368 | 0.502 |
| 4369 | 0.503 |
| 4370 | 0.503 |
| 4371 | 0.503 |
| 4372 | 0.503 |
| 4373 | 0.503 |
| 4374 | 0.503 |
| 4375 | 0.503 |
| 4376 | 0.502 |
| 4377 | 0.503 |
| 4378 | 0.502 |
| 4379 | 0.503 |
| 4380 | 0.502 |
| 4381 | 0.502 |
| 4382 | 0.502 |
| 4383 | 0.503 |
| 4384 | 0.503 |
| 4385 | 0.503 |
| 4386 | 0.503 |
| 4387 | 0.503 |
| 4388 | 0.503 |
| 4389 | 0.503 |
| 4390 | 0.503 |
| 4391 | 0.503 |
| 4392 | 0.503 |
| 4393 | 0.503 |
| 4394 | 0.503 |
| 4395 | 0.503 |
| 4396 | 0.503 |
| 4397 | 0.503 |
| 4398 | 0.503 |
| 4399 | 0.503 |
| 4400 | 0.503 |
| 4401 | 0.503 |
| 4402 | 0.503 |
| 4403 | 0.503 |
| 4404 | 0.503 |
| 4405 | 0.503 |
| 4406 | 0.503 |
| 4407 | 0.503 |
| 4408 | 0.503 |
| 4409 | 0.503 |
| 4410 | 0.503 |
| 4411 | 0.503 |
| 4412 | 0.503 |
| 4413 | 0.502 |
| 4414 | 0.502 |
| 4415 | 0.502 |
| 4416 | 0.503 |
| 4417 | 0.503 |
| 4418 | 0.503 |
| 4419 | 0.502 |
| 4420 | 0.503 |
| 4421 | 0.503 |
| 4422 | 0.503 |
| 4423 | 0.503 |
| 4424 | 0.503 |
| 4425 | 0.503 |
| 4426 | 0.503 |
| 4427 | 0.503 |
| 4428 | 0.503 |
| 4429 | 0.502 |
| 4430 | 0.503 |
| 4431 | 0.503 |
| 4432 | 0.503 |
| 4433 | 0.502 |
| 4434 | 0.503 |
| 4435 | 0.502 |
| 4436 | 0.503 |
| 4437 | 0.503 |
| 4438 | 0.503 |
| 4439 | 0.502 |
| 4440 | 0.503 |
| 4441 | 0.503 |
| 4442 | 0.503 |
| 4443 | 0.503 |
| 4444 | 0.503 |
| 4445 | 0.503 |
| 4446 | 0.503 |
| 4447 | 0.503 |
| 4448 | 0.503 |
| 4449 | 0.503 |
| 4450 | 0.503 |
| 4451 | 0.503 |
| 4452 | 0.503 |
| 4453 | 0.503 |
| 4454 | 0.503 |
| 4455 | 0.503 |
| 4456 | 0.503 |
| 4457 | 0.503 |
| 4458 | 0.503 |
| 4459 | 0.503 |
| 4460 | 0.503 |
| 4461 | 0.503 |
| 4462 | 0.503 |
| 4463 | 0.503 |
| 4464 | 0.503 |
| 4465 | 0.503 |
| 4466 | 0.503 |
| 4467 | 0.503 |
| 4468 | 0.503 |
| 4469 | 0.503 |
| 4470 | 0.503 |
| 4471 | 0.503 |
| 4472 | 0.503 |
| 4473 | 0.503 |
| 4474 | 0.503 |
| 4475 | 0.503 |
| 4476 | 0.503 |
| 4477 | 0.503 |
| 4478 | 0.503 |
| 4479 | 0.503 |
| 4480 | 0.503 |
| 4481 | 0.503 |
| 4482 | 0.503 |
| 4483 | 0.502 |
| 4484 | 0.502 |
| 4485 | 0.502 |
| 4486 | 0.502 |
| 4487 | 0.502 |
| 4488 | 0.502 |
| 4489 | 0.502 |
| 4490 | 0.503 |
| 4491 | 0.502 |
| 4492 | 0.502 |
| 4493 | 0.502 |
| 4494 | 0.502 |
| 4495 | 0.502 |
| 4496 | 0.503 |
| 4497 | 0.503 |
| 4498 | 0.503 |
| 4499 | 0.503 |
| 4500 | 0.503 |
| 4501 | 0.503 |
| 4502 | 0.503 |
| 4503 | 0.503 |
| 4504 | 0.503 |
| 4505 | 0.503 |
| 4506 | 0.503 |
| 4507 | 0.503 |
| 4508 | 0.503 |
| 4509 | 0.502 |
| 4510 | 0.503 |
| 4511 | 0.502 |
| 4512 | 0.502 |
| 4513 | 0.502 |
| 4514 | 0.502 |
| 4515 | 0.502 |
| 4516 | 0.502 |
| 4517 | 0.502 |
| 4518 | 0.502 |
| 4519 | 0.502 |
| 4520 | 0.502 |
| 4521 | 0.502 |
| 4522 | 0.502 |
| 4523 | 0.502 |
| 4524 | 0.502 |
| 4525 | 0.502 |
| 4526 | 0.501 |
| 4527 | 0.501 |
| 4528 | 0.501 |
| 4529 | 0.502 |
| 4530 | 0.502 |
| 4531 | 0.502 |
| 4532 | 0.502 |
| 4533 | 0.502 |
| 4534 | 0.502 |
| 4535 | 0.502 |
| 4536 | 0.502 |
| 4537 | 0.502 |
| 4538 | 0.502 |
| 4539 | 0.502 |
| 4540 | 0.502 |
| 4541 | 0.502 |
| 4542 | 0.502 |
| 4543 | 0.502 |
| 4544 | 0.502 |
| 4545 | 0.502 |
| 4546 | 0.502 |
| 4547 | 0.502 |
| 4548 | 0.502 |
| 4549 | 0.502 |
| 4550 | 0.503 |
| 4551 | 0.502 |
| 4552 | 0.503 |
| 4553 | 0.503 |
| 4554 | 0.503 |
| 4555 | 0.503 |
| 4556 | 0.503 |
| 4557 | 0.503 |
| 4558 | 0.503 |
| 4559 | 0.503 |
| 4560 | 0.503 |
| 4561 | 0.503 |
| 4562 | 0.503 |
| 4563 | 0.503 |
| 4564 | 0.503 |
| 4565 | 0.503 |
| 4566 | 0.503 |
| 4567 | 0.503 |
| 4568 | 0.503 |
| 4569 | 0.503 |
| 4570 | 0.503 |
| 4571 | 0.503 |
| 4572 | 0.503 |
| 4573 | 0.503 |
| 4574 | 0.503 |
| 4575 | 0.503 |
| 4576 | 0.503 |
| 4577 | 0.503 |
| 4578 | 0.503 |
| 4579 | 0.503 |
| 4580 | 0.503 |
| 4581 | 0.503 |
| 4582 | 0.503 |
| 4583 | 0.503 |
| 4584 | 0.503 |
| 4585 | 0.503 |
| 4586 | 0.503 |
| 4587 | 0.503 |
| 4588 | 0.503 |
| 4589 | 0.503 |
| 4590 | 0.503 |
| 4591 | 0.503 |
| 4592 | 0.503 |
| 4593 | 0.503 |
| 4594 | 0.503 |
| 4595 | 0.503 |
| 4596 | 0.503 |
| 4597 | 0.503 |
| 4598 | 0.503 |
| 4599 | 0.503 |
| 4600 | 0.503 |
| 4601 | 0.503 |
| 4602 | 0.503 |
| 4603 | 0.503 |
| 4604 | 0.503 |
| 4605 | 0.503 |
| 4606 | 0.503 |
| 4607 | 0.503 |
| 4608 | 0.503 |
| 4609 | 0.503 |
| 4610 | 0.503 |
| 4611 | 0.503 |
| 4612 | 0.503 |
| 4613 | 0.503 |
| 4614 | 0.503 |
| 4615 | 0.503 |
| 4616 | 0.503 |
| 4617 | 0.503 |
| 4618 | 0.503 |
| 4619 | 0.503 |
| 4620 | 0.503 |
| 4621 | 0.503 |
| 4622 | 0.503 |
| 4623 | 0.503 |
| 4624 | 0.503 |
| 4625 | 0.503 |
| 4626 | 0.503 |
| 4627 | 0.503 |
| 4628 | 0.503 |
| 4629 | 0.503 |
| 4630 | 0.503 |
| 4631 | 0.503 |
| 4632 | 0.503 |
| 4633 | 0.503 |
| 4634 | 0.503 |
| 4635 | 0.503 |
| 4636 | 0.503 |
| 4637 | 0.503 |
| 4638 | 0.503 |
| 4639 | 0.503 |
| 4640 | 0.503 |
| 4641 | 0.503 |
| 4642 | 0.503 |
| 4643 | 0.503 |
| 4644 | 0.503 |
| 4645 | 0.503 |
| 4646 | 0.503 |
| 4647 | 0.503 |
| 4648 | 0.503 |
| 4649 | 0.503 |
| 4650 | 0.503 |
| 4651 | 0.503 |
| 4652 | 0.503 |
| 4653 | 0.503 |
| 4654 | 0.503 |
| 4655 | 0.503 |
| 4656 | 0.503 |
| 4657 | 0.503 |
| 4658 | 0.503 |
| 4659 | 0.503 |
| 4660 | 0.503 |
| 4661 | 0.503 |
| 4662 | 0.503 |
| 4663 | 0.503 |
| 4664 | 0.503 |
| 4665 | 0.503 |
| 4666 | 0.503 |
| 4667 | 0.503 |
| 4668 | 0.503 |
| 4669 | 0.503 |
| 4670 | 0.503 |
| 4671 | 0.503 |
| 4672 | 0.503 |
| 4673 | 0.503 |
| 4674 | 0.503 |
| 4675 | 0.503 |
| 4676 | 0.502 |
| 4677 | 0.503 |
| 4678 | 0.502 |
| 4679 | 0.502 |
| 4680 | 0.502 |
| 4681 | 0.502 |
| 4682 | 0.502 |
| 4683 | 0.502 |
| 4684 | 0.502 |
| 4685 | 0.502 |
| 4686 | 0.502 |
| 4687 | 0.502 |
| 4688 | 0.502 |
| 4689 | 0.502 |
| 4690 | 0.502 |
| 4691 | 0.502 |
| 4692 | 0.502 |
| 4693 | 0.502 |
| 4694 | 0.502 |
| 4695 | 0.502 |
| 4696 | 0.502 |
| 4697 | 0.502 |
| 4698 | 0.502 |
| 4699 | 0.502 |
| 4700 | 0.502 |
| 4701 | 0.502 |
| 4702 | 0.502 |
| 4703 | 0.502 |
| 4704 | 0.502 |
| 4705 | 0.502 |
| 4706 | 0.502 |
| 4707 | 0.502 |
| 4708 | 0.502 |
| 4709 | 0.502 |
| 4710 | 0.502 |
| 4711 | 0.502 |
| 4712 | 0.502 |
| 4713 | 0.502 |
| 4714 | 0.502 |
| 4715 | 0.502 |
| 4716 | 0.502 |
| 4717 | 0.502 |
| 4718 | 0.502 |
| 4719 | 0.502 |
| 4720 | 0.502 |
| 4721 | 0.502 |
| 4722 | 0.502 |
| 4723 | 0.502 |
| 4724 | 0.502 |
| 4725 | 0.502 |
| 4726 | 0.502 |
| 4727 | 0.501 |
| 4728 | 0.502 |
| 4729 | 0.501 |
| 4730 | 0.502 |
| 4731 | 0.501 |
| 4732 | 0.502 |
| 4733 | 0.502 |
| 4734 | 0.502 |
| 4735 | 0.501 |
| 4736 | 0.501 |
| 4737 | 0.501 |
| 4738 | 0.501 |
| 4739 | 0.501 |
| 4740 | 0.501 |
| 4741 | 0.501 |
| 4742 | 0.501 |
| 4743 | 0.501 |
| 4744 | 0.501 |
| 4745 | 0.501 |
| 4746 | 0.501 |
| 4747 | 0.501 |
| 4748 | 0.502 |
| 4749 | 0.502 |
| 4750 | 0.502 |
| 4751 | 0.502 |
| 4752 | 0.502 |
| 4753 | 0.502 |
| 4754 | 0.502 |
| 4755 | 0.502 |
| 4756 | 0.502 |
| 4757 | 0.502 |
| 4758 | 0.502 |
| 4759 | 0.502 |
| 4760 | 0.502 |
| 4761 | 0.502 |
| 4762 | 0.502 |
| 4763 | 0.502 |
| 4764 | 0.502 |
| 4765 | 0.502 |
| 4766 | 0.502 |
| 4767 | 0.502 |
| 4768 | 0.502 |
| 4769 | 0.502 |
| 4770 | 0.502 |
| 4771 | 0.502 |
| 4772 | 0.502 |
| 4773 | 0.503 |
| 4774 | 0.502 |
| 4775 | 0.502 |
| 4776 | 0.502 |
| 4777 | 0.502 |
| 4778 | 0.502 |
| 4779 | 0.502 |
| 4780 | 0.502 |
| 4781 | 0.502 |
| 4782 | 0.502 |
| 4783 | 0.502 |
| 4784 | 0.502 |
| 4785 | 0.502 |
| 4786 | 0.502 |
| 4787 | 0.502 |
| 4788 | 0.502 |
| 4789 | 0.502 |
| 4790 | 0.502 |
| 4791 | 0.502 |
| 4792 | 0.502 |
| 4793 | 0.502 |
| 4794 | 0.502 |
| 4795 | 0.502 |
| 4796 | 0.502 |
| 4797 | 0.502 |
| 4798 | 0.502 |
| 4799 | 0.502 |
| 4800 | 0.502 |
| 4801 | 0.502 |
| 4802 | 0.502 |
| 4803 | 0.502 |
| 4804 | 0.502 |
| 4805 | 0.502 |
| 4806 | 0.502 |
| 4807 | 0.502 |
| 4808 | 0.502 |
| 4809 | 0.502 |
| 4810 | 0.502 |
| 4811 | 0.502 |
| 4812 | 0.502 |
| 4813 | 0.502 |
| 4814 | 0.502 |
| 4815 | 0.502 |
| 4816 | 0.502 |
| 4817 | 0.502 |
| 4818 | 0.502 |
| 4819 | 0.502 |
| 4820 | 0.502 |
| 4821 | 0.502 |
| 4822 | 0.502 |
| 4823 | 0.502 |
| 4824 | 0.502 |
| 4825 | 0.502 |
| 4826 | 0.502 |
| 4827 | 0.502 |
| 4828 | 0.502 |
| 4829 | 0.502 |
| 4830 | 0.502 |
| 4831 | 0.502 |
| 4832 | 0.502 |
| 4833 | 0.502 |
| 4834 | 0.502 |
| 4835 | 0.502 |
| 4836 | 0.502 |
| 4837 | 0.502 |
| 4838 | 0.502 |
| 4839 | 0.502 |
| 4840 | 0.502 |
| 4841 | 0.502 |
| 4842 | 0.502 |
| 4843 | 0.502 |
| 4844 | 0.502 |
| 4845 | 0.502 |
| 4846 | 0.502 |
| 4847 | 0.502 |
| 4848 | 0.502 |
| 4849 | 0.502 |
| 4850 | 0.502 |
| 4851 | 0.502 |
| 4852 | 0.502 |
| 4853 | 0.502 |
| 4854 | 0.502 |
| 4855 | 0.502 |
| 4856 | 0.502 |
| 4857 | 0.502 |
| 4858 | 0.502 |
| 4859 | 0.502 |
| 4860 | 0.502 |
| 4861 | 0.502 |
| 4862 | 0.502 |
| 4863 | 0.502 |
| 4864 | 0.502 |
| 4865 | 0.502 |
| 4866 | 0.502 |
| 4867 | 0.502 |
| 4868 | 0.502 |
| 4869 | 0.502 |
| 4870 | 0.502 |
| 4871 | 0.502 |
| 4872 | 0.503 |
| 4873 | 0.503 |
| 4874 | 0.503 |
| 4875 | 0.503 |
| 4876 | 0.503 |
| 4877 | 0.503 |
| 4878 | 0.503 |
| 4879 | 0.503 |
| 4880 | 0.503 |
| 4881 | 0.503 |
| 4882 | 0.503 |
| 4883 | 0.503 |
| 4884 | 0.504 |
| 4885 | 0.504 |
| 4886 | 0.504 |
| 4887 | 0.504 |
| 4888 | 0.504 |
| 4889 | 0.504 |
| 4890 | 0.504 |
| 4891 | 0.504 |
| 4892 | 0.504 |
| 4893 | 0.504 |
| 4894 | 0.504 |
| 4895 | 0.504 |
| 4896 | 0.504 |
| 4897 | 0.504 |
| 4898 | 0.504 |
| 4899 | 0.504 |
| 4900 | 0.505 |
| 4901 | 0.504 |
| 4902 | 0.505 |
| 4903 | 0.504 |
| 4904 | 0.504 |
| 4905 | 0.504 |
| 4906 | 0.504 |
| 4907 | 0.504 |
| 4908 | 0.504 |
| 4909 | 0.504 |
| 4910 | 0.504 |
| 4911 | 0.504 |
| 4912 | 0.504 |
| 4913 | 0.504 |
| 4914 | 0.504 |
| 4915 | 0.504 |
| 4916 | 0.504 |
| 4917 | 0.504 |
| 4918 | 0.504 |
| 4919 | 0.504 |
| 4920 | 0.504 |
| 4921 | 0.504 |
| 4922 | 0.504 |
| 4923 | 0.504 |
| 4924 | 0.504 |
| 4925 | 0.504 |
| 4926 | 0.504 |
| 4927 | 0.504 |
| 4928 | 0.504 |
| 4929 | 0.504 |
| 4930 | 0.504 |
| 4931 | 0.504 |
| 4932 | 0.504 |
| 4933 | 0.504 |
| 4934 | 0.504 |
| 4935 | 0.504 |
| 4936 | 0.504 |
| 4937 | 0.504 |
| 4938 | 0.504 |
| 4939 | 0.504 |
| 4940 | 0.504 |
| 4941 | 0.504 |
| 4942 | 0.504 |
| 4943 | 0.504 |
| 4944 | 0.504 |
| 4945 | 0.504 |
| 4946 | 0.504 |
| 4947 | 0.504 |
| 4948 | 0.504 |
| 4949 | 0.504 |
| 4950 | 0.504 |
| 4951 | 0.504 |
| 4952 | 0.504 |
| 4953 | 0.504 |
| 4954 | 0.504 |
| 4955 | 0.504 |
| 4956 | 0.504 |
| 4957 | 0.504 |
| 4958 | 0.504 |
| 4959 | 0.504 |
| 4960 | 0.504 |
| 4961 | 0.504 |
| 4962 | 0.504 |
| 4963 | 0.504 |
| 4964 | 0.504 |
| 4965 | 0.504 |
| 4966 | 0.504 |
| 4967 | 0.504 |
| 4968 | 0.504 |
| 4969 | 0.504 |
| 4970 | 0.504 |
| 4971 | 0.504 |
| 4972 | 0.504 |
| 4973 | 0.504 |
| 4974 | 0.504 |
| 4975 | 0.504 |
| 4976 | 0.504 |
| 4977 | 0.504 |
| 4978 | 0.504 |
| 4979 | 0.504 |
| 4980 | 0.504 |
| 4981 | 0.503 |
| 4982 | 0.503 |
| 4983 | 0.503 |
| 4984 | 0.503 |
| 4985 | 0.503 |
| 4986 | 0.503 |
| 4987 | 0.503 |
| 4988 | 0.503 |
| 4989 | 0.503 |
| 4990 | 0.503 |
| 4991 | 0.503 |
| 4992 | 0.503 |
| 4993 | 0.503 |
| 4994 | 0.503 |
| 4995 | 0.503 |
| 4996 | 0.503 |
| 4997 | 0.503 |
| 4998 | 0.503 |
| 4999 | 0.503 |